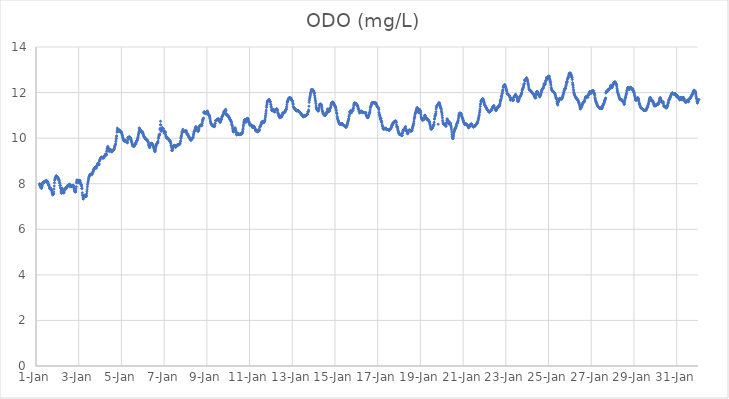
| Category | ODO (mg/L) |
|---|---|
| 44562.166666666664 | 7.94 |
| 44562.177083333336 | 8 |
| 44562.1875 | 7.98 |
| 44562.197916666664 | 7.94 |
| 44562.208333333336 | 7.88 |
| 44562.21875 | 7.84 |
| 44562.229166666664 | 7.82 |
| 44562.239583333336 | 7.82 |
| 44562.25 | 7.81 |
| 44562.260416666664 | 7.81 |
| 44562.270833333336 | 7.81 |
| 44562.28125 | 7.87 |
| 44562.291666666664 | 7.94 |
| 44562.302083333336 | 7.99 |
| 44562.3125 | 8.03 |
| 44562.322916666664 | 8.05 |
| 44562.333333333336 | 8.06 |
| 44562.34375 | 8.05 |
| 44562.354166666664 | 8.04 |
| 44562.364583333336 | 8.04 |
| 44562.375 | 8.06 |
| 44562.385416666664 | 8.09 |
| 44562.395833333336 | 8.1 |
| 44562.40625 | 8.1 |
| 44562.416666666664 | 8.11 |
| 44562.427083333336 | 8.11 |
| 44562.4375 | 8.11 |
| 44562.447916666664 | 8.11 |
| 44562.458333333336 | 8.11 |
| 44562.46875 | 8.12 |
| 44562.479166666664 | 8.12 |
| 44562.489583333336 | 8.12 |
| 44562.5 | 8.12 |
| 44562.510416666664 | 8.12 |
| 44562.520833333336 | 8.12 |
| 44562.53125 | 8.05 |
| 44562.541666666664 | 8.04 |
| 44562.552083333336 | 8.06 |
| 44562.5625 | 8.04 |
| 44562.572916666664 | 7.98 |
| 44562.583333333336 | 7.94 |
| 44562.59375 | 7.95 |
| 44562.604166666664 | 7.94 |
| 44562.614583333336 | 7.9 |
| 44562.625 | 7.86 |
| 44562.635416666664 | 7.81 |
| 44562.645833333336 | 7.81 |
| 44562.65625 | 7.77 |
| 44562.666666666664 | 7.79 |
| 44562.677083333336 | 7.8 |
| 44562.6875 | 7.8 |
| 44562.697916666664 | 7.79 |
| 44562.708333333336 | 7.75 |
| 44562.71875 | 7.71 |
| 44562.729166666664 | 7.72 |
| 44562.739583333336 | 7.69 |
| 44562.75 | 7.63 |
| 44562.760416666664 | 7.56 |
| 44562.770833333336 | 7.54 |
| 44562.78125 | 7.5 |
| 44562.791666666664 | 7.54 |
| 44562.802083333336 | 7.56 |
| 44562.8125 | 7.54 |
| 44562.822916666664 | 7.56 |
| 44562.833333333336 | 7.64 |
| 44562.84375 | 7.77 |
| 44562.854166666664 | 7.9 |
| 44562.864583333336 | 8.04 |
| 44562.875 | 8.15 |
| 44562.885416666664 | 8.19 |
| 44562.895833333336 | 8.22 |
| 44562.90625 | 8.26 |
| 44562.916666666664 | 8.28 |
| 44562.927083333336 | 8.3 |
| 44562.9375 | 8.33 |
| 44562.947916666664 | 8.35 |
| 44562.958333333336 | 8.34 |
| 44562.96875 | 8.31 |
| 44562.979166666664 | 8.31 |
| 44562.989583333336 | 8.29 |
| 44563.0 | 8.28 |
| 44563.010416666664 | 8.28 |
| 44563.020833333336 | 8.27 |
| 44563.03125 | 8.26 |
| 44563.041666666664 | 8.2 |
| 44563.052083333336 | 8.19 |
| 44563.0625 | 8.2 |
| 44563.072916666664 | 8.15 |
| 44563.083333333336 | 8.16 |
| 44563.09375 | 8.12 |
| 44563.104166666664 | 8.04 |
| 44563.114583333336 | 8.02 |
| 44563.125 | 7.92 |
| 44563.135416666664 | 7.93 |
| 44563.145833333336 | 7.82 |
| 44563.15625 | 7.79 |
| 44563.166666666664 | 7.68 |
| 44563.177083333336 | 7.63 |
| 44563.1875 | 7.58 |
| 44563.197916666664 | 7.76 |
| 44563.208333333336 | 7.8 |
| 44563.21875 | 7.81 |
| 44563.229166666664 | 7.78 |
| 44563.239583333336 | 7.73 |
| 44563.25 | 7.67 |
| 44563.260416666664 | 7.62 |
| 44563.270833333336 | 7.61 |
| 44563.28125 | 7.61 |
| 44563.291666666664 | 7.61 |
| 44563.302083333336 | 7.59 |
| 44563.3125 | 7.61 |
| 44563.322916666664 | 7.68 |
| 44563.333333333336 | 7.73 |
| 44563.34375 | 7.77 |
| 44563.354166666664 | 7.79 |
| 44563.364583333336 | 7.79 |
| 44563.375 | 7.8 |
| 44563.385416666664 | 7.78 |
| 44563.395833333336 | 7.77 |
| 44563.40625 | 7.78 |
| 44563.416666666664 | 7.8 |
| 44563.427083333336 | 7.83 |
| 44563.4375 | 7.86 |
| 44563.447916666664 | 7.89 |
| 44563.458333333336 | 7.89 |
| 44563.46875 | 7.9 |
| 44563.479166666664 | 7.9 |
| 44563.489583333336 | 7.92 |
| 44563.5 | 7.91 |
| 44563.510416666664 | 7.92 |
| 44563.520833333336 | 7.91 |
| 44563.53125 | 7.94 |
| 44563.541666666664 | 7.92 |
| 44563.552083333336 | 7.94 |
| 44563.5625 | 7.98 |
| 44563.572916666664 | 7.96 |
| 44563.583333333336 | 7.86 |
| 44563.59375 | 7.96 |
| 44563.604166666664 | 7.94 |
| 44563.614583333336 | 7.91 |
| 44563.625 | 7.88 |
| 44563.635416666664 | 7.88 |
| 44563.645833333336 | 7.87 |
| 44563.65625 | 7.88 |
| 44563.666666666664 | 7.89 |
| 44563.677083333336 | 7.89 |
| 44563.6875 | 7.89 |
| 44563.697916666664 | 7.92 |
| 44563.708333333336 | 7.89 |
| 44563.71875 | 7.92 |
| 44563.729166666664 | 7.91 |
| 44563.739583333336 | 7.93 |
| 44563.75 | 7.93 |
| 44563.760416666664 | 7.9 |
| 44563.770833333336 | 7.88 |
| 44563.78125 | 7.8 |
| 44563.791666666664 | 7.75 |
| 44563.802083333336 | 7.7 |
| 44563.8125 | 7.65 |
| 44563.822916666664 | 7.65 |
| 44563.833333333336 | 7.66 |
| 44563.84375 | 7.65 |
| 44563.854166666664 | 7.63 |
| 44563.864583333336 | 7.68 |
| 44563.875 | 7.77 |
| 44563.885416666664 | 7.87 |
| 44563.895833333336 | 8.04 |
| 44563.90625 | 8.11 |
| 44563.916666666664 | 8.16 |
| 44563.927083333336 | 8.16 |
| 44563.9375 | 8.12 |
| 44563.947916666664 | 8.06 |
| 44563.958333333336 | 8.04 |
| 44563.96875 | 8.04 |
| 44563.979166666664 | 8.06 |
| 44563.989583333336 | 8.08 |
| 44564.0 | 8.11 |
| 44564.010416666664 | 8.13 |
| 44564.020833333336 | 8.14 |
| 44564.03125 | 8.15 |
| 44564.041666666664 | 8.14 |
| 44564.052083333336 | 8.14 |
| 44564.0625 | 8.12 |
| 44564.072916666664 | 8.01 |
| 44564.083333333336 | 8.06 |
| 44564.09375 | 8.01 |
| 44564.104166666664 | 7.97 |
| 44564.114583333336 | 7.95 |
| 44564.125 | 7.94 |
| 44564.135416666664 | 7.89 |
| 44564.145833333336 | 7.78 |
| 44564.15625 | 7.8 |
| 44564.166666666664 | 7.6 |
| 44564.177083333336 | 7.5 |
| 44564.1875 | 7.48 |
| 44564.197916666664 | 7.41 |
| 44564.208333333336 | 7.33 |
| 44564.21875 | 7.34 |
| 44564.229166666664 | 7.41 |
| 44564.239583333336 | 7.48 |
| 44564.25 | 7.49 |
| 44564.260416666664 | 7.5 |
| 44564.270833333336 | 7.47 |
| 44564.28125 | 7.45 |
| 44564.291666666664 | 7.45 |
| 44564.302083333336 | 7.45 |
| 44564.3125 | 7.47 |
| 44564.322916666664 | 7.47 |
| 44564.333333333336 | 7.48 |
| 44564.34375 | 7.43 |
| 44564.354166666664 | 7.46 |
| 44564.364583333336 | 7.48 |
| 44564.375 | 7.57 |
| 44564.385416666664 | 7.66 |
| 44564.395833333336 | 7.75 |
| 44564.40625 | 7.86 |
| 44564.416666666664 | 7.96 |
| 44564.427083333336 | 8.03 |
| 44564.4375 | 8.08 |
| 44564.447916666664 | 8.13 |
| 44564.458333333336 | 8.2 |
| 44564.46875 | 8.25 |
| 44564.479166666664 | 8.29 |
| 44564.489583333336 | 8.33 |
| 44564.5 | 8.34 |
| 44564.510416666664 | 8.36 |
| 44564.520833333336 | 8.38 |
| 44564.53125 | 8.4 |
| 44564.541666666664 | 8.41 |
| 44564.552083333336 | 8.41 |
| 44564.5625 | 8.41 |
| 44564.572916666664 | 8.42 |
| 44564.583333333336 | 8.41 |
| 44564.59375 | 8.39 |
| 44564.604166666664 | 8.43 |
| 44564.614583333336 | 8.41 |
| 44564.625 | 8.42 |
| 44564.635416666664 | 8.44 |
| 44564.645833333336 | 8.48 |
| 44564.65625 | 8.5 |
| 44564.666666666664 | 8.52 |
| 44564.677083333336 | 8.53 |
| 44564.6875 | 8.58 |
| 44564.697916666664 | 8.62 |
| 44564.708333333336 | 8.62 |
| 44564.71875 | 8.67 |
| 44564.729166666664 | 8.66 |
| 44564.739583333336 | 8.69 |
| 44564.75 | 8.7 |
| 44564.760416666664 | 8.69 |
| 44564.770833333336 | 8.71 |
| 44564.78125 | 8.71 |
| 44564.791666666664 | 8.69 |
| 44564.802083333336 | 8.69 |
| 44564.8125 | 8.72 |
| 44564.822916666664 | 8.68 |
| 44564.833333333336 | 8.75 |
| 44564.84375 | 8.77 |
| 44564.854166666664 | 8.8 |
| 44564.864583333336 | 8.8 |
| 44564.875 | 8.85 |
| 44564.885416666664 | 8.88 |
| 44564.895833333336 | 8.9 |
| 44564.90625 | 8.89 |
| 44564.916666666664 | 8.88 |
| 44564.927083333336 | 8.87 |
| 44564.9375 | 8.84 |
| 44564.947916666664 | 8.83 |
| 44564.958333333336 | 8.87 |
| 44564.96875 | 8.99 |
| 44564.979166666664 | 9.02 |
| 44564.989583333336 | 9.04 |
| 44565.0 | 9.08 |
| 44565.010416666664 | 9.1 |
| 44565.020833333336 | 9.11 |
| 44565.03125 | 9.12 |
| 44565.041666666664 | 9.14 |
| 44565.052083333336 | 9.16 |
| 44565.0625 | 9.16 |
| 44565.072916666664 | 9.16 |
| 44565.083333333336 | 9.16 |
| 44565.09375 | 9.16 |
| 44565.104166666664 | 9.15 |
| 44565.114583333336 | 9.15 |
| 44565.125 | 9.12 |
| 44565.135416666664 | 9.13 |
| 44565.145833333336 | 9.13 |
| 44565.15625 | 9.14 |
| 44565.166666666664 | 9.16 |
| 44565.177083333336 | 9.14 |
| 44565.1875 | 9.16 |
| 44565.197916666664 | 9.22 |
| 44565.208333333336 | 9.21 |
| 44565.21875 | 9.23 |
| 44565.229166666664 | 9.23 |
| 44565.239583333336 | 9.26 |
| 44565.25 | 9.3 |
| 44565.260416666664 | 9.28 |
| 44565.270833333336 | 9.27 |
| 44565.28125 | 9.3 |
| 44565.291666666664 | 9.25 |
| 44565.302083333336 | 9.29 |
| 44565.3125 | 9.41 |
| 44565.322916666664 | 9.47 |
| 44565.333333333336 | 9.52 |
| 44565.34375 | 9.56 |
| 44565.354166666664 | 9.6 |
| 44565.364583333336 | 9.64 |
| 44565.375 | 9.6 |
| 44565.385416666664 | 9.56 |
| 44565.395833333336 | 9.53 |
| 44565.40625 | 9.51 |
| 44565.416666666664 | 9.5 |
| 44565.427083333336 | 9.46 |
| 44565.4375 | 9.41 |
| 44565.447916666664 | 9.44 |
| 44565.458333333336 | 9.46 |
| 44565.46875 | 9.49 |
| 44565.479166666664 | 9.5 |
| 44565.489583333336 | 9.49 |
| 44565.5 | 9.48 |
| 44565.510416666664 | 9.48 |
| 44565.520833333336 | 9.47 |
| 44565.53125 | 9.43 |
| 44565.541666666664 | 9.4 |
| 44565.552083333336 | 9.4 |
| 44565.5625 | 9.41 |
| 44565.572916666664 | 9.43 |
| 44565.583333333336 | 9.45 |
| 44565.59375 | 9.45 |
| 44565.604166666664 | 9.45 |
| 44565.614583333336 | 9.47 |
| 44565.625 | 9.48 |
| 44565.635416666664 | 9.5 |
| 44565.645833333336 | 9.5 |
| 44565.65625 | 9.52 |
| 44565.666666666664 | 9.55 |
| 44565.677083333336 | 9.6 |
| 44565.6875 | 9.64 |
| 44565.697916666664 | 9.67 |
| 44565.708333333336 | 9.7 |
| 44565.71875 | 9.73 |
| 44565.729166666664 | 9.75 |
| 44565.739583333336 | 9.85 |
| 44565.75 | 9.92 |
| 44565.760416666664 | 9.99 |
| 44565.770833333336 | 10.07 |
| 44565.78125 | 10.1 |
| 44565.791666666664 | 10.26 |
| 44565.802083333336 | 10.35 |
| 44565.8125 | 10.44 |
| 44565.822916666664 | 10.38 |
| 44565.833333333336 | 10.34 |
| 44565.84375 | 10.3 |
| 44565.854166666664 | 10.29 |
| 44565.864583333336 | 10.33 |
| 44565.875 | 10.34 |
| 44565.885416666664 | 10.35 |
| 44565.895833333336 | 10.36 |
| 44565.90625 | 10.36 |
| 44565.916666666664 | 10.32 |
| 44565.927083333336 | 10.3 |
| 44565.9375 | 10.28 |
| 44565.947916666664 | 10.27 |
| 44565.958333333336 | 10.29 |
| 44565.96875 | 10.31 |
| 44565.979166666664 | 10.3 |
| 44565.989583333336 | 10.27 |
| 44566.0 | 10.25 |
| 44566.010416666664 | 10.23 |
| 44566.020833333336 | 10.19 |
| 44566.03125 | 10.16 |
| 44566.041666666664 | 10.12 |
| 44566.052083333336 | 10.09 |
| 44566.0625 | 10.04 |
| 44566.072916666664 | 10 |
| 44566.083333333336 | 9.97 |
| 44566.09375 | 9.93 |
| 44566.104166666664 | 9.91 |
| 44566.114583333336 | 9.89 |
| 44566.125 | 9.88 |
| 44566.135416666664 | 9.87 |
| 44566.145833333336 | 9.86 |
| 44566.15625 | 9.87 |
| 44566.166666666664 | 9.91 |
| 44566.177083333336 | 9.92 |
| 44566.1875 | 9.87 |
| 44566.197916666664 | 9.86 |
| 44566.208333333336 | 9.84 |
| 44566.21875 | 9.87 |
| 44566.229166666664 | 9.85 |
| 44566.239583333336 | 9.86 |
| 44566.25 | 9.83 |
| 44566.260416666664 | 9.83 |
| 44566.270833333336 | 9.83 |
| 44566.28125 | 9.79 |
| 44566.291666666664 | 9.9 |
| 44566.302083333336 | 10.01 |
| 44566.3125 | 10.03 |
| 44566.322916666664 | 10.03 |
| 44566.333333333336 | 10.05 |
| 44566.34375 | 9.99 |
| 44566.354166666664 | 9.99 |
| 44566.364583333336 | 10.02 |
| 44566.375 | 10.05 |
| 44566.385416666664 | 10.06 |
| 44566.395833333336 | 10.02 |
| 44566.40625 | 10.01 |
| 44566.416666666664 | 10.01 |
| 44566.427083333336 | 10 |
| 44566.4375 | 9.99 |
| 44566.447916666664 | 9.95 |
| 44566.458333333336 | 9.9 |
| 44566.46875 | 9.87 |
| 44566.479166666664 | 9.84 |
| 44566.489583333336 | 9.81 |
| 44566.5 | 9.77 |
| 44566.510416666664 | 9.72 |
| 44566.520833333336 | 9.69 |
| 44566.53125 | 9.66 |
| 44566.541666666664 | 9.66 |
| 44566.552083333336 | 9.65 |
| 44566.5625 | 9.65 |
| 44566.572916666664 | 9.65 |
| 44566.583333333336 | 9.65 |
| 44566.59375 | 9.65 |
| 44566.604166666664 | 9.66 |
| 44566.614583333336 | 9.69 |
| 44566.625 | 9.71 |
| 44566.635416666664 | 9.73 |
| 44566.645833333336 | 9.75 |
| 44566.65625 | 9.77 |
| 44566.666666666664 | 9.77 |
| 44566.677083333336 | 9.74 |
| 44566.6875 | 9.8 |
| 44566.697916666664 | 9.85 |
| 44566.708333333336 | 9.87 |
| 44566.71875 | 9.89 |
| 44566.729166666664 | 9.9 |
| 44566.739583333336 | 9.91 |
| 44566.75 | 9.96 |
| 44566.760416666664 | 9.98 |
| 44566.770833333336 | 10.03 |
| 44566.78125 | 10.06 |
| 44566.791666666664 | 10.13 |
| 44566.802083333336 | 10.18 |
| 44566.8125 | 10.23 |
| 44566.822916666664 | 10.3 |
| 44566.833333333336 | 10.45 |
| 44566.84375 | 10.42 |
| 44566.854166666664 | 10.37 |
| 44566.864583333336 | 10.35 |
| 44566.875 | 10.37 |
| 44566.885416666664 | 10.35 |
| 44566.895833333336 | 10.36 |
| 44566.90625 | 10.32 |
| 44566.916666666664 | 10.33 |
| 44566.927083333336 | 10.34 |
| 44566.9375 | 10.28 |
| 44566.947916666664 | 10.26 |
| 44566.958333333336 | 10.23 |
| 44566.96875 | 10.24 |
| 44566.979166666664 | 10.26 |
| 44566.989583333336 | 10.27 |
| 44567.0 | 10.25 |
| 44567.010416666664 | 10.21 |
| 44567.020833333336 | 10.17 |
| 44567.03125 | 10.14 |
| 44567.041666666664 | 10.1 |
| 44567.052083333336 | 10.08 |
| 44567.0625 | 10.05 |
| 44567.072916666664 | 10.03 |
| 44567.083333333336 | 10.03 |
| 44567.09375 | 10.03 |
| 44567.104166666664 | 10.02 |
| 44567.114583333336 | 9.99 |
| 44567.125 | 9.98 |
| 44567.135416666664 | 9.96 |
| 44567.145833333336 | 9.95 |
| 44567.15625 | 9.95 |
| 44567.166666666664 | 9.94 |
| 44567.177083333336 | 9.93 |
| 44567.1875 | 9.93 |
| 44567.197916666664 | 9.93 |
| 44567.208333333336 | 9.89 |
| 44567.21875 | 9.89 |
| 44567.229166666664 | 9.87 |
| 44567.239583333336 | 9.87 |
| 44567.25 | 9.83 |
| 44567.260416666664 | 9.83 |
| 44567.270833333336 | 9.74 |
| 44567.28125 | 9.68 |
| 44567.291666666664 | 9.68 |
| 44567.302083333336 | 9.62 |
| 44567.3125 | 9.59 |
| 44567.322916666664 | 9.59 |
| 44567.333333333336 | 9.62 |
| 44567.34375 | 9.74 |
| 44567.354166666664 | 9.75 |
| 44567.364583333336 | 9.73 |
| 44567.375 | 9.74 |
| 44567.385416666664 | 9.75 |
| 44567.395833333336 | 9.76 |
| 44567.40625 | 9.71 |
| 44567.416666666664 | 9.78 |
| 44567.427083333336 | 9.77 |
| 44567.4375 | 9.75 |
| 44567.447916666664 | 9.73 |
| 44567.458333333336 | 9.71 |
| 44567.46875 | 9.71 |
| 44567.479166666664 | 9.7 |
| 44567.489583333336 | 9.67 |
| 44567.5 | 9.62 |
| 44567.510416666664 | 9.59 |
| 44567.520833333336 | 9.55 |
| 44567.53125 | 9.52 |
| 44567.541666666664 | 9.47 |
| 44567.552083333336 | 9.44 |
| 44567.5625 | 9.41 |
| 44567.572916666664 | 9.41 |
| 44567.583333333336 | 9.45 |
| 44567.59375 | 9.51 |
| 44567.604166666664 | 9.58 |
| 44567.614583333336 | 9.64 |
| 44567.625 | 9.67 |
| 44567.635416666664 | 9.71 |
| 44567.645833333336 | 9.72 |
| 44567.65625 | 9.76 |
| 44567.666666666664 | 9.78 |
| 44567.677083333336 | 9.77 |
| 44567.6875 | 9.82 |
| 44567.697916666664 | 9.83 |
| 44567.708333333336 | 9.79 |
| 44567.71875 | 9.87 |
| 44567.729166666664 | 9.98 |
| 44567.739583333336 | 10.02 |
| 44567.75 | 10.09 |
| 44567.760416666664 | 10.14 |
| 44567.770833333336 | 10.14 |
| 44567.78125 | 10.12 |
| 44567.791666666664 | 10.18 |
| 44567.802083333336 | 10.38 |
| 44567.8125 | 10.43 |
| 44567.822916666664 | 10.59 |
| 44567.833333333336 | 10.74 |
| 44567.84375 | 10.58 |
| 44567.854166666664 | 10.39 |
| 44567.864583333336 | 10.3 |
| 44567.875 | 10.33 |
| 44567.885416666664 | 10.35 |
| 44567.895833333336 | 10.45 |
| 44567.90625 | 10.43 |
| 44567.916666666664 | 10.46 |
| 44567.927083333336 | 10.44 |
| 44567.9375 | 10.42 |
| 44567.947916666664 | 10.41 |
| 44567.958333333336 | 10.41 |
| 44567.96875 | 10.34 |
| 44567.979166666664 | 10.33 |
| 44567.989583333336 | 10.28 |
| 44568.0 | 10.23 |
| 44568.010416666664 | 10.21 |
| 44568.020833333336 | 10.23 |
| 44568.03125 | 10.25 |
| 44568.041666666664 | 10.27 |
| 44568.052083333336 | 10.29 |
| 44568.0625 | 10.24 |
| 44568.072916666664 | 10.14 |
| 44568.083333333336 | 10.09 |
| 44568.09375 | 10.05 |
| 44568.104166666664 | 10.02 |
| 44568.114583333336 | 10.01 |
| 44568.125 | 10 |
| 44568.135416666664 | 10.01 |
| 44568.145833333336 | 10.02 |
| 44568.15625 | 10 |
| 44568.166666666664 | 10.01 |
| 44568.177083333336 | 9.99 |
| 44568.1875 | 9.98 |
| 44568.197916666664 | 9.96 |
| 44568.208333333336 | 9.95 |
| 44568.21875 | 9.93 |
| 44568.229166666664 | 9.93 |
| 44568.239583333336 | 9.9 |
| 44568.25 | 9.9 |
| 44568.260416666664 | 9.88 |
| 44568.270833333336 | 9.87 |
| 44568.28125 | 9.86 |
| 44568.291666666664 | 9.87 |
| 44568.302083333336 | 9.82 |
| 44568.3125 | 9.76 |
| 44568.322916666664 | 9.69 |
| 44568.333333333336 | 9.66 |
| 44568.34375 | 9.6 |
| 44568.354166666664 | 9.46 |
| 44568.364583333336 | 9.53 |
| 44568.375 | 9.45 |
| 44568.385416666664 | 9.46 |
| 44568.395833333336 | 9.5 |
| 44568.40625 | 9.56 |
| 44568.416666666664 | 9.58 |
| 44568.427083333336 | 9.6 |
| 44568.4375 | 9.65 |
| 44568.447916666664 | 9.67 |
| 44568.458333333336 | 9.68 |
| 44568.46875 | 9.68 |
| 44568.479166666664 | 9.67 |
| 44568.489583333336 | 9.67 |
| 44568.5 | 9.68 |
| 44568.510416666664 | 9.68 |
| 44568.520833333336 | 9.64 |
| 44568.53125 | 9.61 |
| 44568.541666666664 | 9.6 |
| 44568.552083333336 | 9.62 |
| 44568.5625 | 9.63 |
| 44568.572916666664 | 9.64 |
| 44568.583333333336 | 9.66 |
| 44568.59375 | 9.66 |
| 44568.604166666664 | 9.68 |
| 44568.614583333336 | 9.7 |
| 44568.625 | 9.71 |
| 44568.635416666664 | 9.71 |
| 44568.645833333336 | 9.72 |
| 44568.65625 | 9.71 |
| 44568.666666666664 | 9.7 |
| 44568.677083333336 | 9.7 |
| 44568.6875 | 9.72 |
| 44568.697916666664 | 9.71 |
| 44568.708333333336 | 9.72 |
| 44568.71875 | 9.73 |
| 44568.729166666664 | 9.75 |
| 44568.739583333336 | 9.74 |
| 44568.75 | 9.78 |
| 44568.760416666664 | 9.85 |
| 44568.770833333336 | 9.87 |
| 44568.78125 | 9.98 |
| 44568.791666666664 | 10.02 |
| 44568.802083333336 | 10.07 |
| 44568.8125 | 10.11 |
| 44568.822916666664 | 10.18 |
| 44568.833333333336 | 10.29 |
| 44568.84375 | 10.26 |
| 44568.854166666664 | 10.27 |
| 44568.864583333336 | 10.3 |
| 44568.875 | 10.39 |
| 44568.885416666664 | 10.3 |
| 44568.895833333336 | 10.29 |
| 44568.90625 | 10.29 |
| 44568.916666666664 | 10.28 |
| 44568.927083333336 | 10.28 |
| 44568.9375 | 10.31 |
| 44568.947916666664 | 10.3 |
| 44568.958333333336 | 10.3 |
| 44568.96875 | 10.31 |
| 44568.979166666664 | 10.3 |
| 44568.989583333336 | 10.31 |
| 44569.0 | 10.31 |
| 44569.010416666664 | 10.3 |
| 44569.020833333336 | 10.31 |
| 44569.03125 | 10.32 |
| 44569.041666666664 | 10.31 |
| 44569.052083333336 | 10.24 |
| 44569.0625 | 10.21 |
| 44569.072916666664 | 10.17 |
| 44569.083333333336 | 10.18 |
| 44569.09375 | 10.18 |
| 44569.104166666664 | 10.19 |
| 44569.114583333336 | 10.17 |
| 44569.125 | 10.12 |
| 44569.135416666664 | 10.09 |
| 44569.145833333336 | 10.07 |
| 44569.15625 | 10.06 |
| 44569.166666666664 | 10.06 |
| 44569.177083333336 | 10.03 |
| 44569.1875 | 10 |
| 44569.197916666664 | 9.98 |
| 44569.208333333336 | 9.97 |
| 44569.21875 | 9.96 |
| 44569.229166666664 | 9.94 |
| 44569.239583333336 | 9.94 |
| 44569.25 | 9.92 |
| 44569.260416666664 | 9.9 |
| 44569.270833333336 | 9.93 |
| 44569.28125 | 9.96 |
| 44569.291666666664 | 9.96 |
| 44569.302083333336 | 9.97 |
| 44569.3125 | 9.98 |
| 44569.322916666664 | 9.99 |
| 44569.333333333336 | 9.99 |
| 44569.34375 | 10.02 |
| 44569.354166666664 | 10.03 |
| 44569.364583333336 | 10.09 |
| 44569.375 | 10.15 |
| 44569.385416666664 | 10.2 |
| 44569.395833333336 | 10.26 |
| 44569.40625 | 10.29 |
| 44569.416666666664 | 10.3 |
| 44569.427083333336 | 10.31 |
| 44569.4375 | 10.35 |
| 44569.447916666664 | 10.39 |
| 44569.458333333336 | 10.42 |
| 44569.46875 | 10.47 |
| 44569.479166666664 | 10.5 |
| 44569.489583333336 | 10.48 |
| 44569.5 | 10.49 |
| 44569.510416666664 | 10.48 |
| 44569.520833333336 | 10.43 |
| 44569.53125 | 10.41 |
| 44569.541666666664 | 10.38 |
| 44569.552083333336 | 10.35 |
| 44569.5625 | 10.33 |
| 44569.572916666664 | 10.32 |
| 44569.583333333336 | 10.3 |
| 44569.59375 | 10.3 |
| 44569.604166666664 | 10.33 |
| 44569.614583333336 | 10.35 |
| 44569.625 | 10.39 |
| 44569.635416666664 | 10.44 |
| 44569.645833333336 | 10.49 |
| 44569.65625 | 10.52 |
| 44569.666666666664 | 10.55 |
| 44569.677083333336 | 10.56 |
| 44569.6875 | 10.56 |
| 44569.697916666664 | 10.58 |
| 44569.708333333336 | 10.56 |
| 44569.71875 | 10.56 |
| 44569.729166666664 | 10.57 |
| 44569.739583333336 | 10.56 |
| 44569.75 | 10.55 |
| 44569.760416666664 | 10.56 |
| 44569.770833333336 | 10.56 |
| 44569.78125 | 10.64 |
| 44569.791666666664 | 10.71 |
| 44569.802083333336 | 10.8 |
| 44569.8125 | 10.78 |
| 44569.822916666664 | 10.83 |
| 44569.833333333336 | 10.86 |
| 44569.84375 | 10.88 |
| 44569.854166666664 | 11.11 |
| 44569.864583333336 | 11.14 |
| 44569.875 | 11.15 |
| 44569.885416666664 | 11.16 |
| 44569.895833333336 | 11.13 |
| 44569.90625 | 11.11 |
| 44569.916666666664 | 11.09 |
| 44569.927083333336 | 11.08 |
| 44569.9375 | 11.08 |
| 44569.947916666664 | 11.08 |
| 44569.958333333336 | 11.09 |
| 44569.96875 | 11.11 |
| 44569.979166666664 | 11.12 |
| 44569.989583333336 | 11.14 |
| 44570.0 | 11.16 |
| 44570.010416666664 | 11.18 |
| 44570.020833333336 | 11.18 |
| 44570.03125 | 11.18 |
| 44570.041666666664 | 11.12 |
| 44570.052083333336 | 11.1 |
| 44570.0625 | 11.09 |
| 44570.072916666664 | 11.04 |
| 44570.083333333336 | 11.01 |
| 44570.09375 | 11 |
| 44570.104166666664 | 11.02 |
| 44570.114583333336 | 11 |
| 44570.125 | 10.96 |
| 44570.135416666664 | 10.9 |
| 44570.145833333336 | 10.86 |
| 44570.15625 | 10.8 |
| 44570.166666666664 | 10.74 |
| 44570.177083333336 | 10.7 |
| 44570.1875 | 10.66 |
| 44570.197916666664 | 10.65 |
| 44570.208333333336 | 10.63 |
| 44570.21875 | 10.6 |
| 44570.229166666664 | 10.59 |
| 44570.239583333336 | 10.58 |
| 44570.25 | 10.57 |
| 44570.260416666664 | 10.56 |
| 44570.270833333336 | 10.54 |
| 44570.28125 | 10.55 |
| 44570.291666666664 | 10.55 |
| 44570.302083333336 | 10.54 |
| 44570.3125 | 10.52 |
| 44570.322916666664 | 10.53 |
| 44570.333333333336 | 10.51 |
| 44570.34375 | 10.52 |
| 44570.354166666664 | 10.5 |
| 44570.364583333336 | 10.53 |
| 44570.375 | 10.57 |
| 44570.385416666664 | 10.65 |
| 44570.395833333336 | 10.65 |
| 44570.40625 | 10.77 |
| 44570.416666666664 | 10.77 |
| 44570.427083333336 | 10.78 |
| 44570.4375 | 10.78 |
| 44570.447916666664 | 10.79 |
| 44570.458333333336 | 10.79 |
| 44570.46875 | 10.8 |
| 44570.479166666664 | 10.82 |
| 44570.489583333336 | 10.83 |
| 44570.5 | 10.81 |
| 44570.510416666664 | 10.81 |
| 44570.520833333336 | 10.8 |
| 44570.53125 | 10.85 |
| 44570.541666666664 | 10.85 |
| 44570.552083333336 | 10.8 |
| 44570.5625 | 10.82 |
| 44570.572916666664 | 10.78 |
| 44570.583333333336 | 10.77 |
| 44570.59375 | 10.77 |
| 44570.604166666664 | 10.73 |
| 44570.614583333336 | 10.71 |
| 44570.625 | 10.69 |
| 44570.635416666664 | 10.72 |
| 44570.645833333336 | 10.74 |
| 44570.65625 | 10.77 |
| 44570.666666666664 | 10.81 |
| 44570.677083333336 | 10.83 |
| 44570.6875 | 10.86 |
| 44570.697916666664 | 10.89 |
| 44570.708333333336 | 10.94 |
| 44570.71875 | 10.94 |
| 44570.729166666664 | 10.97 |
| 44570.739583333336 | 10.99 |
| 44570.75 | 11.01 |
| 44570.760416666664 | 11.04 |
| 44570.770833333336 | 11.05 |
| 44570.78125 | 11.07 |
| 44570.791666666664 | 11.14 |
| 44570.802083333336 | 11.16 |
| 44570.8125 | 11.12 |
| 44570.822916666664 | 11.16 |
| 44570.833333333336 | 11.15 |
| 44570.84375 | 11.19 |
| 44570.854166666664 | 11.22 |
| 44570.864583333336 | 11.25 |
| 44570.875 | 11.21 |
| 44570.885416666664 | 11.26 |
| 44570.895833333336 | 11.21 |
| 44570.90625 | 11.08 |
| 44570.916666666664 | 11.03 |
| 44570.927083333336 | 11.02 |
| 44570.9375 | 11.01 |
| 44570.947916666664 | 11.02 |
| 44570.958333333336 | 11.02 |
| 44570.96875 | 11.01 |
| 44570.979166666664 | 10.99 |
| 44570.989583333336 | 10.98 |
| 44571.0 | 10.97 |
| 44571.010416666664 | 10.95 |
| 44571.020833333336 | 10.94 |
| 44571.03125 | 10.92 |
| 44571.041666666664 | 10.89 |
| 44571.052083333336 | 10.89 |
| 44571.0625 | 10.9 |
| 44571.072916666664 | 10.84 |
| 44571.083333333336 | 10.81 |
| 44571.09375 | 10.8 |
| 44571.104166666664 | 10.79 |
| 44571.114583333336 | 10.8 |
| 44571.125 | 10.77 |
| 44571.135416666664 | 10.73 |
| 44571.145833333336 | 10.71 |
| 44571.15625 | 10.68 |
| 44571.166666666664 | 10.6 |
| 44571.177083333336 | 10.58 |
| 44571.1875 | 10.56 |
| 44571.197916666664 | 10.5 |
| 44571.208333333336 | 10.43 |
| 44571.21875 | 10.36 |
| 44571.229166666664 | 10.31 |
| 44571.239583333336 | 10.28 |
| 44571.25 | 10.28 |
| 44571.260416666664 | 10.29 |
| 44571.270833333336 | 10.31 |
| 44571.28125 | 10.36 |
| 44571.291666666664 | 10.39 |
| 44571.302083333336 | 10.38 |
| 44571.3125 | 10.4 |
| 44571.322916666664 | 10.46 |
| 44571.333333333336 | 10.41 |
| 44571.34375 | 10.38 |
| 44571.354166666664 | 10.35 |
| 44571.364583333336 | 10.31 |
| 44571.375 | 10.27 |
| 44571.385416666664 | 10.18 |
| 44571.395833333336 | 10.15 |
| 44571.40625 | 10.14 |
| 44571.416666666664 | 10.18 |
| 44571.427083333336 | 10.19 |
| 44571.4375 | 10.2 |
| 44571.447916666664 | 10.2 |
| 44571.458333333336 | 10.2 |
| 44571.46875 | 10.21 |
| 44571.479166666664 | 10.19 |
| 44571.489583333336 | 10.17 |
| 44571.5 | 10.17 |
| 44571.510416666664 | 10.16 |
| 44571.520833333336 | 10.16 |
| 44571.53125 | 10.16 |
| 44571.541666666664 | 10.17 |
| 44571.552083333336 | 10.17 |
| 44571.5625 | 10.19 |
| 44571.572916666664 | 10.17 |
| 44571.583333333336 | 10.17 |
| 44571.59375 | 10.17 |
| 44571.604166666664 | 10.19 |
| 44571.614583333336 | 10.19 |
| 44571.625 | 10.18 |
| 44571.635416666664 | 10.2 |
| 44571.645833333336 | 10.23 |
| 44571.65625 | 10.22 |
| 44571.666666666664 | 10.25 |
| 44571.677083333336 | 10.31 |
| 44571.6875 | 10.38 |
| 44571.697916666664 | 10.44 |
| 44571.708333333336 | 10.53 |
| 44571.71875 | 10.59 |
| 44571.729166666664 | 10.67 |
| 44571.739583333336 | 10.72 |
| 44571.75 | 10.76 |
| 44571.760416666664 | 10.8 |
| 44571.770833333336 | 10.81 |
| 44571.78125 | 10.81 |
| 44571.791666666664 | 10.8 |
| 44571.802083333336 | 10.79 |
| 44571.8125 | 10.77 |
| 44571.822916666664 | 10.72 |
| 44571.833333333336 | 10.69 |
| 44571.84375 | 10.73 |
| 44571.854166666664 | 10.81 |
| 44571.864583333336 | 10.82 |
| 44571.875 | 10.83 |
| 44571.885416666664 | 10.85 |
| 44571.895833333336 | 10.87 |
| 44571.90625 | 10.85 |
| 44571.916666666664 | 10.86 |
| 44571.927083333336 | 10.85 |
| 44571.9375 | 10.81 |
| 44571.947916666664 | 10.78 |
| 44571.958333333336 | 10.73 |
| 44571.96875 | 10.73 |
| 44571.979166666664 | 10.69 |
| 44571.989583333336 | 10.65 |
| 44572.0 | 10.65 |
| 44572.010416666664 | 10.59 |
| 44572.020833333336 | 10.57 |
| 44572.03125 | 10.57 |
| 44572.041666666664 | 10.57 |
| 44572.052083333336 | 10.58 |
| 44572.0625 | 10.58 |
| 44572.072916666664 | 10.57 |
| 44572.083333333336 | 10.56 |
| 44572.09375 | 10.56 |
| 44572.104166666664 | 10.55 |
| 44572.114583333336 | 10.51 |
| 44572.125 | 10.5 |
| 44572.135416666664 | 10.47 |
| 44572.145833333336 | 10.47 |
| 44572.15625 | 10.46 |
| 44572.166666666664 | 10.48 |
| 44572.177083333336 | 10.51 |
| 44572.1875 | 10.53 |
| 44572.197916666664 | 10.52 |
| 44572.208333333336 | 10.5 |
| 44572.21875 | 10.49 |
| 44572.229166666664 | 10.48 |
| 44572.239583333336 | 10.45 |
| 44572.25 | 10.43 |
| 44572.260416666664 | 10.41 |
| 44572.270833333336 | 10.39 |
| 44572.28125 | 10.35 |
| 44572.291666666664 | 10.33 |
| 44572.302083333336 | 10.31 |
| 44572.3125 | 10.31 |
| 44572.322916666664 | 10.32 |
| 44572.333333333336 | 10.32 |
| 44572.34375 | 10.33 |
| 44572.354166666664 | 10.32 |
| 44572.364583333336 | 10.3 |
| 44572.375 | 10.28 |
| 44572.385416666664 | 10.28 |
| 44572.395833333336 | 10.32 |
| 44572.40625 | 10.31 |
| 44572.416666666664 | 10.31 |
| 44572.427083333336 | 10.3 |
| 44572.4375 | 10.39 |
| 44572.447916666664 | 10.37 |
| 44572.458333333336 | 10.35 |
| 44572.46875 | 10.37 |
| 44572.479166666664 | 10.48 |
| 44572.489583333336 | 10.51 |
| 44572.5 | 10.51 |
| 44572.510416666664 | 10.52 |
| 44572.520833333336 | 10.56 |
| 44572.53125 | 10.59 |
| 44572.541666666664 | 10.62 |
| 44572.552083333336 | 10.66 |
| 44572.5625 | 10.69 |
| 44572.572916666664 | 10.7 |
| 44572.583333333336 | 10.71 |
| 44572.59375 | 10.73 |
| 44572.604166666664 | 10.7 |
| 44572.614583333336 | 10.66 |
| 44572.625 | 10.68 |
| 44572.635416666664 | 10.73 |
| 44572.645833333336 | 10.71 |
| 44572.65625 | 10.71 |
| 44572.666666666664 | 10.7 |
| 44572.677083333336 | 10.68 |
| 44572.6875 | 10.73 |
| 44572.697916666664 | 10.74 |
| 44572.708333333336 | 10.77 |
| 44572.71875 | 10.79 |
| 44572.729166666664 | 10.84 |
| 44572.739583333336 | 10.92 |
| 44572.75 | 10.99 |
| 44572.760416666664 | 11.07 |
| 44572.770833333336 | 11.15 |
| 44572.78125 | 11.23 |
| 44572.791666666664 | 11.35 |
| 44572.802083333336 | 11.42 |
| 44572.8125 | 11.49 |
| 44572.822916666664 | 11.54 |
| 44572.833333333336 | 11.58 |
| 44572.84375 | 11.62 |
| 44572.854166666664 | 11.64 |
| 44572.864583333336 | 11.66 |
| 44572.875 | 11.68 |
| 44572.885416666664 | 11.67 |
| 44572.895833333336 | 11.66 |
| 44572.90625 | 11.68 |
| 44572.916666666664 | 11.69 |
| 44572.927083333336 | 11.67 |
| 44572.9375 | 11.67 |
| 44572.947916666664 | 11.62 |
| 44572.958333333336 | 11.6 |
| 44572.96875 | 11.61 |
| 44572.979166666664 | 11.6 |
| 44572.989583333336 | 11.49 |
| 44573.0 | 11.47 |
| 44573.010416666664 | 11.39 |
| 44573.020833333336 | 11.35 |
| 44573.03125 | 11.27 |
| 44573.041666666664 | 11.21 |
| 44573.052083333336 | 11.2 |
| 44573.0625 | 11.2 |
| 44573.072916666664 | 11.22 |
| 44573.083333333336 | 11.24 |
| 44573.09375 | 11.25 |
| 44573.104166666664 | 11.25 |
| 44573.114583333336 | 11.25 |
| 44573.125 | 11.26 |
| 44573.135416666664 | 11.24 |
| 44573.145833333336 | 11.17 |
| 44573.15625 | 11.18 |
| 44573.166666666664 | 11.16 |
| 44573.177083333336 | 11.16 |
| 44573.1875 | 11.15 |
| 44573.197916666664 | 11.19 |
| 44573.208333333336 | 11.23 |
| 44573.21875 | 11.24 |
| 44573.229166666664 | 11.24 |
| 44573.239583333336 | 11.26 |
| 44573.25 | 11.27 |
| 44573.260416666664 | 11.28 |
| 44573.270833333336 | 11.29 |
| 44573.28125 | 11.28 |
| 44573.291666666664 | 11.26 |
| 44573.302083333336 | 11.24 |
| 44573.3125 | 11.21 |
| 44573.322916666664 | 11.13 |
| 44573.333333333336 | 11.09 |
| 44573.34375 | 11.07 |
| 44573.354166666664 | 11.04 |
| 44573.364583333336 | 11.01 |
| 44573.375 | 10.98 |
| 44573.385416666664 | 10.95 |
| 44573.395833333336 | 10.94 |
| 44573.40625 | 10.92 |
| 44573.416666666664 | 10.89 |
| 44573.427083333336 | 10.9 |
| 44573.4375 | 10.91 |
| 44573.447916666664 | 10.93 |
| 44573.458333333336 | 10.96 |
| 44573.46875 | 10.99 |
| 44573.479166666664 | 10.94 |
| 44573.489583333336 | 10.93 |
| 44573.5 | 10.94 |
| 44573.510416666664 | 10.94 |
| 44573.520833333336 | 10.98 |
| 44573.53125 | 11 |
| 44573.541666666664 | 11.05 |
| 44573.552083333336 | 11.1 |
| 44573.5625 | 11.11 |
| 44573.572916666664 | 11.1 |
| 44573.583333333336 | 11.1 |
| 44573.59375 | 11.1 |
| 44573.604166666664 | 11.11 |
| 44573.614583333336 | 11.11 |
| 44573.625 | 11.12 |
| 44573.635416666664 | 11.13 |
| 44573.645833333336 | 11.16 |
| 44573.65625 | 11.15 |
| 44573.666666666664 | 11.15 |
| 44573.677083333336 | 11.21 |
| 44573.6875 | 11.22 |
| 44573.697916666664 | 11.25 |
| 44573.708333333336 | 11.25 |
| 44573.71875 | 11.27 |
| 44573.729166666664 | 11.32 |
| 44573.739583333336 | 11.39 |
| 44573.75 | 11.48 |
| 44573.760416666664 | 11.59 |
| 44573.770833333336 | 11.57 |
| 44573.78125 | 11.6 |
| 44573.791666666664 | 11.65 |
| 44573.802083333336 | 11.67 |
| 44573.8125 | 11.7 |
| 44573.822916666664 | 11.72 |
| 44573.833333333336 | 11.74 |
| 44573.84375 | 11.76 |
| 44573.854166666664 | 11.76 |
| 44573.864583333336 | 11.77 |
| 44573.875 | 11.77 |
| 44573.885416666664 | 11.77 |
| 44573.895833333336 | 11.76 |
| 44573.90625 | 11.76 |
| 44573.916666666664 | 11.75 |
| 44573.927083333336 | 11.73 |
| 44573.9375 | 11.76 |
| 44573.947916666664 | 11.75 |
| 44573.958333333336 | 11.7 |
| 44573.96875 | 11.66 |
| 44573.979166666664 | 11.65 |
| 44573.989583333336 | 11.65 |
| 44574.0 | 11.64 |
| 44574.010416666664 | 11.64 |
| 44574.020833333336 | 11.59 |
| 44574.03125 | 11.53 |
| 44574.041666666664 | 11.48 |
| 44574.052083333336 | 11.39 |
| 44574.0625 | 11.36 |
| 44574.072916666664 | 11.35 |
| 44574.083333333336 | 11.33 |
| 44574.09375 | 11.31 |
| 44574.104166666664 | 11.3 |
| 44574.114583333336 | 11.29 |
| 44574.125 | 11.28 |
| 44574.135416666664 | 11.25 |
| 44574.145833333336 | 11.25 |
| 44574.15625 | 11.25 |
| 44574.166666666664 | 11.25 |
| 44574.177083333336 | 11.24 |
| 44574.1875 | 11.22 |
| 44574.197916666664 | 11.19 |
| 44574.208333333336 | 11.21 |
| 44574.21875 | 11.2 |
| 44574.229166666664 | 11.2 |
| 44574.239583333336 | 11.21 |
| 44574.25 | 11.21 |
| 44574.260416666664 | 11.2 |
| 44574.270833333336 | 11.2 |
| 44574.28125 | 11.21 |
| 44574.291666666664 | 11.2 |
| 44574.302083333336 | 11.18 |
| 44574.3125 | 11.17 |
| 44574.322916666664 | 11.17 |
| 44574.333333333336 | 11.16 |
| 44574.34375 | 11.15 |
| 44574.354166666664 | 11.13 |
| 44574.364583333336 | 11.12 |
| 44574.375 | 11.11 |
| 44574.385416666664 | 11.1 |
| 44574.395833333336 | 11.08 |
| 44574.40625 | 11.07 |
| 44574.416666666664 | 11.06 |
| 44574.427083333336 | 11.05 |
| 44574.4375 | 11.04 |
| 44574.447916666664 | 11.01 |
| 44574.458333333336 | 11.01 |
| 44574.46875 | 11 |
| 44574.479166666664 | 10.98 |
| 44574.489583333336 | 10.97 |
| 44574.5 | 10.95 |
| 44574.510416666664 | 10.95 |
| 44574.520833333336 | 10.95 |
| 44574.53125 | 10.93 |
| 44574.541666666664 | 10.95 |
| 44574.552083333336 | 10.99 |
| 44574.5625 | 10.98 |
| 44574.572916666664 | 10.98 |
| 44574.583333333336 | 11 |
| 44574.59375 | 10.99 |
| 44574.604166666664 | 10.98 |
| 44574.614583333336 | 10.97 |
| 44574.625 | 10.98 |
| 44574.635416666664 | 10.98 |
| 44574.645833333336 | 11 |
| 44574.65625 | 11 |
| 44574.666666666664 | 11.02 |
| 44574.677083333336 | 11.03 |
| 44574.6875 | 11.02 |
| 44574.697916666664 | 11.03 |
| 44574.708333333336 | 11.05 |
| 44574.71875 | 11.08 |
| 44574.729166666664 | 11.15 |
| 44574.739583333336 | 11.15 |
| 44574.75 | 11.17 |
| 44574.760416666664 | 11.17 |
| 44574.770833333336 | 11.24 |
| 44574.78125 | 11.4 |
| 44574.791666666664 | 11.57 |
| 44574.802083333336 | 11.66 |
| 44574.8125 | 11.72 |
| 44574.822916666664 | 11.79 |
| 44574.833333333336 | 11.83 |
| 44574.84375 | 11.88 |
| 44574.854166666664 | 11.94 |
| 44574.864583333336 | 12 |
| 44574.875 | 12.03 |
| 44574.885416666664 | 12.11 |
| 44574.895833333336 | 12.13 |
| 44574.90625 | 12.13 |
| 44574.916666666664 | 12.13 |
| 44574.927083333336 | 12.13 |
| 44574.9375 | 12.13 |
| 44574.947916666664 | 12.13 |
| 44574.958333333336 | 12.12 |
| 44574.96875 | 12.08 |
| 44574.979166666664 | 12.09 |
| 44574.989583333336 | 12.07 |
| 44575.0 | 12.05 |
| 44575.010416666664 | 12.03 |
| 44575.020833333336 | 11.99 |
| 44575.03125 | 11.95 |
| 44575.041666666664 | 11.97 |
| 44575.052083333336 | 11.86 |
| 44575.0625 | 11.78 |
| 44575.072916666664 | 11.72 |
| 44575.083333333336 | 11.65 |
| 44575.09375 | 11.59 |
| 44575.104166666664 | 11.51 |
| 44575.114583333336 | 11.41 |
| 44575.125 | 11.35 |
| 44575.135416666664 | 11.3 |
| 44575.145833333336 | 11.28 |
| 44575.15625 | 11.26 |
| 44575.166666666664 | 11.24 |
| 44575.177083333336 | 11.23 |
| 44575.1875 | 11.22 |
| 44575.197916666664 | 11.21 |
| 44575.208333333336 | 11.19 |
| 44575.21875 | 11.19 |
| 44575.229166666664 | 11.21 |
| 44575.239583333336 | 11.23 |
| 44575.25 | 11.29 |
| 44575.260416666664 | 11.34 |
| 44575.270833333336 | 11.43 |
| 44575.28125 | 11.48 |
| 44575.291666666664 | 11.49 |
| 44575.302083333336 | 11.48 |
| 44575.3125 | 11.49 |
| 44575.322916666664 | 11.49 |
| 44575.333333333336 | 11.49 |
| 44575.34375 | 11.49 |
| 44575.354166666664 | 11.48 |
| 44575.364583333336 | 11.45 |
| 44575.375 | 11.4 |
| 44575.385416666664 | 11.34 |
| 44575.395833333336 | 11.27 |
| 44575.40625 | 11.21 |
| 44575.416666666664 | 11.18 |
| 44575.427083333336 | 11.15 |
| 44575.4375 | 11.11 |
| 44575.447916666664 | 11.08 |
| 44575.458333333336 | 11.06 |
| 44575.46875 | 11.04 |
| 44575.479166666664 | 11.03 |
| 44575.489583333336 | 11.02 |
| 44575.5 | 11.06 |
| 44575.510416666664 | 10.99 |
| 44575.520833333336 | 10.99 |
| 44575.53125 | 11 |
| 44575.541666666664 | 11.02 |
| 44575.552083333336 | 11.03 |
| 44575.5625 | 11.02 |
| 44575.572916666664 | 11.05 |
| 44575.583333333336 | 11.05 |
| 44575.59375 | 11.07 |
| 44575.604166666664 | 11.1 |
| 44575.614583333336 | 11.11 |
| 44575.625 | 11.16 |
| 44575.635416666664 | 11.16 |
| 44575.645833333336 | 11.27 |
| 44575.65625 | 11.19 |
| 44575.666666666664 | 11.26 |
| 44575.677083333336 | 11.28 |
| 44575.6875 | 11.22 |
| 44575.697916666664 | 11.16 |
| 44575.708333333336 | 11.16 |
| 44575.71875 | 11.16 |
| 44575.729166666664 | 11.18 |
| 44575.739583333336 | 11.2 |
| 44575.75 | 11.21 |
| 44575.760416666664 | 11.29 |
| 44575.770833333336 | 11.32 |
| 44575.78125 | 11.32 |
| 44575.791666666664 | 11.33 |
| 44575.802083333336 | 11.36 |
| 44575.8125 | 11.44 |
| 44575.822916666664 | 11.46 |
| 44575.833333333336 | 11.5 |
| 44575.84375 | 11.55 |
| 44575.854166666664 | 11.56 |
| 44575.864583333336 | 11.56 |
| 44575.875 | 11.57 |
| 44575.885416666664 | 11.57 |
| 44575.895833333336 | 11.58 |
| 44575.90625 | 11.58 |
| 44575.916666666664 | 11.57 |
| 44575.927083333336 | 11.56 |
| 44575.9375 | 11.53 |
| 44575.947916666664 | 11.51 |
| 44575.958333333336 | 11.49 |
| 44575.96875 | 11.46 |
| 44575.979166666664 | 11.44 |
| 44575.989583333336 | 11.41 |
| 44576.0 | 11.43 |
| 44576.010416666664 | 11.39 |
| 44576.020833333336 | 11.36 |
| 44576.03125 | 11.33 |
| 44576.041666666664 | 11.29 |
| 44576.052083333336 | 11.23 |
| 44576.0625 | 11.21 |
| 44576.072916666664 | 11.12 |
| 44576.083333333336 | 11.1 |
| 44576.09375 | 11.07 |
| 44576.104166666664 | 10.96 |
| 44576.114583333336 | 10.89 |
| 44576.125 | 10.85 |
| 44576.135416666664 | 10.82 |
| 44576.145833333336 | 10.76 |
| 44576.15625 | 10.75 |
| 44576.166666666664 | 10.75 |
| 44576.177083333336 | 10.69 |
| 44576.1875 | 10.67 |
| 44576.197916666664 | 10.66 |
| 44576.208333333336 | 10.64 |
| 44576.21875 | 10.63 |
| 44576.229166666664 | 10.62 |
| 44576.239583333336 | 10.62 |
| 44576.25 | 10.6 |
| 44576.260416666664 | 10.61 |
| 44576.270833333336 | 10.6 |
| 44576.28125 | 10.6 |
| 44576.291666666664 | 10.63 |
| 44576.302083333336 | 10.65 |
| 44576.3125 | 10.6 |
| 44576.322916666664 | 10.61 |
| 44576.333333333336 | 10.63 |
| 44576.34375 | 10.63 |
| 44576.354166666664 | 10.61 |
| 44576.364583333336 | 10.59 |
| 44576.375 | 10.59 |
| 44576.385416666664 | 10.58 |
| 44576.395833333336 | 10.57 |
| 44576.40625 | 10.56 |
| 44576.416666666664 | 10.56 |
| 44576.427083333336 | 10.56 |
| 44576.4375 | 10.55 |
| 44576.447916666664 | 10.54 |
| 44576.458333333336 | 10.53 |
| 44576.46875 | 10.52 |
| 44576.479166666664 | 10.51 |
| 44576.489583333336 | 10.5 |
| 44576.5 | 10.49 |
| 44576.510416666664 | 10.48 |
| 44576.520833333336 | 10.48 |
| 44576.53125 | 10.49 |
| 44576.541666666664 | 10.51 |
| 44576.552083333336 | 10.56 |
| 44576.5625 | 10.57 |
| 44576.572916666664 | 10.59 |
| 44576.583333333336 | 10.63 |
| 44576.59375 | 10.67 |
| 44576.604166666664 | 10.71 |
| 44576.614583333336 | 10.74 |
| 44576.625 | 10.78 |
| 44576.635416666664 | 10.82 |
| 44576.645833333336 | 10.85 |
| 44576.65625 | 10.95 |
| 44576.666666666664 | 10.98 |
| 44576.677083333336 | 11.04 |
| 44576.6875 | 11.15 |
| 44576.697916666664 | 11.15 |
| 44576.708333333336 | 11.16 |
| 44576.71875 | 11.2 |
| 44576.729166666664 | 11.18 |
| 44576.739583333336 | 11.14 |
| 44576.75 | 11.12 |
| 44576.760416666664 | 11.11 |
| 44576.770833333336 | 11.12 |
| 44576.78125 | 11.15 |
| 44576.791666666664 | 11.18 |
| 44576.802083333336 | 11.21 |
| 44576.8125 | 11.22 |
| 44576.822916666664 | 11.22 |
| 44576.833333333336 | 11.21 |
| 44576.84375 | 11.23 |
| 44576.854166666664 | 11.29 |
| 44576.864583333336 | 11.33 |
| 44576.875 | 11.42 |
| 44576.885416666664 | 11.46 |
| 44576.895833333336 | 11.5 |
| 44576.90625 | 11.52 |
| 44576.916666666664 | 11.54 |
| 44576.927083333336 | 11.54 |
| 44576.9375 | 11.53 |
| 44576.947916666664 | 11.53 |
| 44576.958333333336 | 11.53 |
| 44576.96875 | 11.52 |
| 44576.979166666664 | 11.52 |
| 44576.989583333336 | 11.51 |
| 44577.0 | 11.49 |
| 44577.010416666664 | 11.48 |
| 44577.020833333336 | 11.47 |
| 44577.03125 | 11.46 |
| 44577.041666666664 | 11.45 |
| 44577.052083333336 | 11.43 |
| 44577.0625 | 11.41 |
| 44577.072916666664 | 11.38 |
| 44577.083333333336 | 11.33 |
| 44577.09375 | 11.3 |
| 44577.104166666664 | 11.29 |
| 44577.114583333336 | 11.24 |
| 44577.125 | 11.19 |
| 44577.135416666664 | 11.16 |
| 44577.145833333336 | 11.11 |
| 44577.15625 | 11.15 |
| 44577.166666666664 | 11.11 |
| 44577.177083333336 | 11.18 |
| 44577.1875 | 11.16 |
| 44577.197916666664 | 11.15 |
| 44577.208333333336 | 11.17 |
| 44577.21875 | 11.17 |
| 44577.229166666664 | 11.16 |
| 44577.239583333336 | 11.18 |
| 44577.25 | 11.19 |
| 44577.260416666664 | 11.18 |
| 44577.270833333336 | 11.14 |
| 44577.28125 | 11.13 |
| 44577.291666666664 | 11.12 |
| 44577.302083333336 | 11.12 |
| 44577.3125 | 11.11 |
| 44577.322916666664 | 11.12 |
| 44577.333333333336 | 11.13 |
| 44577.34375 | 11.13 |
| 44577.354166666664 | 11.12 |
| 44577.364583333336 | 11.12 |
| 44577.375 | 11.12 |
| 44577.385416666664 | 11.12 |
| 44577.395833333336 | 11.12 |
| 44577.40625 | 11.12 |
| 44577.416666666664 | 11.12 |
| 44577.427083333336 | 11.12 |
| 44577.4375 | 11.12 |
| 44577.447916666664 | 11.11 |
| 44577.458333333336 | 11.05 |
| 44577.46875 | 11.01 |
| 44577.479166666664 | 10.98 |
| 44577.489583333336 | 10.95 |
| 44577.5 | 10.93 |
| 44577.510416666664 | 10.92 |
| 44577.520833333336 | 10.91 |
| 44577.53125 | 10.9 |
| 44577.541666666664 | 10.9 |
| 44577.552083333336 | 10.91 |
| 44577.5625 | 10.95 |
| 44577.572916666664 | 10.97 |
| 44577.583333333336 | 11.01 |
| 44577.59375 | 11.02 |
| 44577.604166666664 | 11.06 |
| 44577.614583333336 | 11.11 |
| 44577.625 | 11.12 |
| 44577.635416666664 | 11.18 |
| 44577.645833333336 | 11.24 |
| 44577.65625 | 11.33 |
| 44577.666666666664 | 11.36 |
| 44577.677083333336 | 11.39 |
| 44577.6875 | 11.42 |
| 44577.697916666664 | 11.45 |
| 44577.708333333336 | 11.47 |
| 44577.71875 | 11.51 |
| 44577.729166666664 | 11.55 |
| 44577.739583333336 | 11.55 |
| 44577.75 | 11.55 |
| 44577.760416666664 | 11.53 |
| 44577.770833333336 | 11.56 |
| 44577.78125 | 11.55 |
| 44577.791666666664 | 11.56 |
| 44577.802083333336 | 11.55 |
| 44577.8125 | 11.56 |
| 44577.822916666664 | 11.56 |
| 44577.833333333336 | 11.55 |
| 44577.84375 | 11.55 |
| 44577.854166666664 | 11.54 |
| 44577.864583333336 | 11.52 |
| 44577.875 | 11.52 |
| 44577.885416666664 | 11.54 |
| 44577.895833333336 | 11.54 |
| 44577.90625 | 11.55 |
| 44577.916666666664 | 11.54 |
| 44577.927083333336 | 11.53 |
| 44577.9375 | 11.49 |
| 44577.947916666664 | 11.46 |
| 44577.958333333336 | 11.44 |
| 44577.96875 | 11.4 |
| 44577.979166666664 | 11.38 |
| 44577.989583333336 | 11.36 |
| 44578.0 | 11.37 |
| 44578.010416666664 | 11.37 |
| 44578.020833333336 | 11.35 |
| 44578.03125 | 11.33 |
| 44578.041666666664 | 11.3 |
| 44578.052083333336 | 11.25 |
| 44578.0625 | 11.13 |
| 44578.072916666664 | 11.06 |
| 44578.083333333336 | 11.03 |
| 44578.09375 | 10.99 |
| 44578.104166666664 | 10.95 |
| 44578.114583333336 | 10.89 |
| 44578.125 | 10.82 |
| 44578.135416666664 | 10.88 |
| 44578.145833333336 | 10.86 |
| 44578.15625 | 10.86 |
| 44578.166666666664 | 10.72 |
| 44578.177083333336 | 10.7 |
| 44578.1875 | 10.75 |
| 44578.197916666664 | 10.71 |
| 44578.208333333336 | 10.61 |
| 44578.21875 | 10.54 |
| 44578.229166666664 | 10.51 |
| 44578.239583333336 | 10.5 |
| 44578.25 | 10.43 |
| 44578.260416666664 | 10.42 |
| 44578.270833333336 | 10.39 |
| 44578.28125 | 10.4 |
| 44578.291666666664 | 10.42 |
| 44578.302083333336 | 10.41 |
| 44578.3125 | 10.42 |
| 44578.322916666664 | 10.4 |
| 44578.333333333336 | 10.43 |
| 44578.34375 | 10.43 |
| 44578.354166666664 | 10.42 |
| 44578.364583333336 | 10.42 |
| 44578.375 | 10.44 |
| 44578.385416666664 | 10.43 |
| 44578.395833333336 | 10.41 |
| 44578.40625 | 10.4 |
| 44578.416666666664 | 10.37 |
| 44578.427083333336 | 10.38 |
| 44578.4375 | 10.38 |
| 44578.447916666664 | 10.38 |
| 44578.458333333336 | 10.38 |
| 44578.46875 | 10.38 |
| 44578.479166666664 | 10.38 |
| 44578.489583333336 | 10.37 |
| 44578.5 | 10.37 |
| 44578.510416666664 | 10.36 |
| 44578.520833333336 | 10.36 |
| 44578.53125 | 10.36 |
| 44578.541666666664 | 10.35 |
| 44578.552083333336 | 10.36 |
| 44578.5625 | 10.36 |
| 44578.572916666664 | 10.37 |
| 44578.583333333336 | 10.38 |
| 44578.59375 | 10.4 |
| 44578.604166666664 | 10.41 |
| 44578.614583333336 | 10.42 |
| 44578.625 | 10.45 |
| 44578.635416666664 | 10.47 |
| 44578.645833333336 | 10.48 |
| 44578.65625 | 10.54 |
| 44578.666666666664 | 10.57 |
| 44578.677083333336 | 10.59 |
| 44578.6875 | 10.63 |
| 44578.697916666664 | 10.6 |
| 44578.708333333336 | 10.59 |
| 44578.71875 | 10.65 |
| 44578.729166666664 | 10.67 |
| 44578.739583333336 | 10.68 |
| 44578.75 | 10.7 |
| 44578.760416666664 | 10.7 |
| 44578.770833333336 | 10.7 |
| 44578.78125 | 10.72 |
| 44578.791666666664 | 10.73 |
| 44578.802083333336 | 10.73 |
| 44578.8125 | 10.75 |
| 44578.822916666664 | 10.74 |
| 44578.833333333336 | 10.72 |
| 44578.84375 | 10.76 |
| 44578.854166666664 | 10.75 |
| 44578.864583333336 | 10.7 |
| 44578.875 | 10.69 |
| 44578.885416666664 | 10.58 |
| 44578.895833333336 | 10.5 |
| 44578.90625 | 10.48 |
| 44578.916666666664 | 10.5 |
| 44578.927083333336 | 10.47 |
| 44578.9375 | 10.41 |
| 44578.947916666664 | 10.36 |
| 44578.958333333336 | 10.33 |
| 44578.96875 | 10.28 |
| 44578.979166666664 | 10.25 |
| 44578.989583333336 | 10.23 |
| 44579.0 | 10.2 |
| 44579.010416666664 | 10.18 |
| 44579.020833333336 | 10.16 |
| 44579.03125 | 10.16 |
| 44579.041666666664 | 10.16 |
| 44579.052083333336 | 10.15 |
| 44579.0625 | 10.15 |
| 44579.072916666664 | 10.17 |
| 44579.083333333336 | 10.16 |
| 44579.09375 | 10.15 |
| 44579.104166666664 | 10.14 |
| 44579.114583333336 | 10.13 |
| 44579.125 | 10.12 |
| 44579.135416666664 | 10.11 |
| 44579.145833333336 | 10.12 |
| 44579.15625 | 10.2 |
| 44579.166666666664 | 10.25 |
| 44579.177083333336 | 10.28 |
| 44579.1875 | 10.33 |
| 44579.197916666664 | 10.34 |
| 44579.208333333336 | 10.36 |
| 44579.21875 | 10.37 |
| 44579.229166666664 | 10.4 |
| 44579.239583333336 | 10.39 |
| 44579.25 | 10.39 |
| 44579.260416666664 | 10.4 |
| 44579.270833333336 | 10.36 |
| 44579.28125 | 10.46 |
| 44579.291666666664 | 10.45 |
| 44579.302083333336 | 10.51 |
| 44579.3125 | 10.39 |
| 44579.322916666664 | 10.38 |
| 44579.333333333336 | 10.39 |
| 44579.34375 | 10.31 |
| 44579.354166666664 | 10.3 |
| 44579.364583333336 | 10.31 |
| 44579.375 | 10.28 |
| 44579.385416666664 | 10.22 |
| 44579.395833333336 | 10.2 |
| 44579.40625 | 10.19 |
| 44579.416666666664 | 10.22 |
| 44579.427083333336 | 10.26 |
| 44579.4375 | 10.29 |
| 44579.447916666664 | 10.3 |
| 44579.458333333336 | 10.32 |
| 44579.46875 | 10.34 |
| 44579.479166666664 | 10.36 |
| 44579.489583333336 | 10.36 |
| 44579.5 | 10.36 |
| 44579.510416666664 | 10.33 |
| 44579.520833333336 | 10.33 |
| 44579.53125 | 10.32 |
| 44579.541666666664 | 10.31 |
| 44579.552083333336 | 10.31 |
| 44579.5625 | 10.31 |
| 44579.572916666664 | 10.32 |
| 44579.583333333336 | 10.32 |
| 44579.59375 | 10.33 |
| 44579.604166666664 | 10.36 |
| 44579.614583333336 | 10.36 |
| 44579.625 | 10.44 |
| 44579.635416666664 | 10.47 |
| 44579.645833333336 | 10.51 |
| 44579.65625 | 10.55 |
| 44579.666666666664 | 10.58 |
| 44579.677083333336 | 10.64 |
| 44579.6875 | 10.65 |
| 44579.697916666664 | 10.74 |
| 44579.708333333336 | 10.84 |
| 44579.71875 | 10.88 |
| 44579.729166666664 | 10.92 |
| 44579.739583333336 | 10.97 |
| 44579.75 | 11.04 |
| 44579.760416666664 | 11.08 |
| 44579.770833333336 | 11.11 |
| 44579.78125 | 11.13 |
| 44579.791666666664 | 11.16 |
| 44579.802083333336 | 11.21 |
| 44579.8125 | 11.25 |
| 44579.822916666664 | 11.26 |
| 44579.833333333336 | 11.31 |
| 44579.84375 | 11.34 |
| 44579.854166666664 | 11.33 |
| 44579.864583333336 | 11.31 |
| 44579.875 | 11.28 |
| 44579.885416666664 | 11.25 |
| 44579.895833333336 | 11.21 |
| 44579.90625 | 11.16 |
| 44579.916666666664 | 11.12 |
| 44579.927083333336 | 11.16 |
| 44579.9375 | 11.14 |
| 44579.947916666664 | 11.12 |
| 44579.958333333336 | 11.25 |
| 44579.96875 | 11.26 |
| 44579.979166666664 | 11.23 |
| 44579.989583333336 | 11.21 |
| 44580.0 | 11.18 |
| 44580.010416666664 | 11.13 |
| 44580.020833333336 | 11.05 |
| 44580.03125 | 10.97 |
| 44580.041666666664 | 10.91 |
| 44580.052083333336 | 10.88 |
| 44580.0625 | 10.85 |
| 44580.072916666664 | 10.84 |
| 44580.083333333336 | 10.82 |
| 44580.09375 | 10.78 |
| 44580.104166666664 | 10.79 |
| 44580.114583333336 | 10.8 |
| 44580.125 | 10.81 |
| 44580.135416666664 | 10.81 |
| 44580.145833333336 | 10.81 |
| 44580.15625 | 10.82 |
| 44580.166666666664 | 10.84 |
| 44580.177083333336 | 10.87 |
| 44580.1875 | 10.92 |
| 44580.197916666664 | 10.98 |
| 44580.208333333336 | 11.01 |
| 44580.21875 | 10.99 |
| 44580.229166666664 | 10.97 |
| 44580.239583333336 | 10.94 |
| 44580.25 | 10.91 |
| 44580.260416666664 | 10.89 |
| 44580.270833333336 | 10.88 |
| 44580.28125 | 10.85 |
| 44580.291666666664 | 10.86 |
| 44580.302083333336 | 10.85 |
| 44580.3125 | 10.8 |
| 44580.322916666664 | 10.85 |
| 44580.333333333336 | 10.85 |
| 44580.34375 | 10.84 |
| 44580.354166666664 | 10.81 |
| 44580.364583333336 | 10.8 |
| 44580.375 | 10.8 |
| 44580.385416666664 | 10.79 |
| 44580.395833333336 | 10.76 |
| 44580.40625 | 10.73 |
| 44580.416666666664 | 10.73 |
| 44580.427083333336 | 10.7 |
| 44580.4375 | 10.65 |
| 44580.447916666664 | 10.61 |
| 44580.458333333336 | 10.57 |
| 44580.46875 | 10.51 |
| 44580.479166666664 | 10.45 |
| 44580.489583333336 | 10.42 |
| 44580.5 | 10.4 |
| 44580.510416666664 | 10.39 |
| 44580.520833333336 | 10.39 |
| 44580.53125 | 10.41 |
| 44580.541666666664 | 10.42 |
| 44580.552083333336 | 10.44 |
| 44580.5625 | 10.45 |
| 44580.572916666664 | 10.47 |
| 44580.583333333336 | 10.49 |
| 44580.59375 | 10.52 |
| 44580.604166666664 | 10.54 |
| 44580.614583333336 | 10.57 |
| 44580.625 | 10.59 |
| 44580.635416666664 | 10.6 |
| 44580.645833333336 | 10.7 |
| 44580.65625 | 10.85 |
| 44580.666666666664 | 10.84 |
| 44580.677083333336 | 10.94 |
| 44580.6875 | 10.98 |
| 44580.697916666664 | 11.01 |
| 44580.708333333336 | 11.03 |
| 44580.71875 | 11.08 |
| 44580.729166666664 | 11.16 |
| 44580.739583333336 | 11.28 |
| 44580.75 | 11.35 |
| 44580.760416666664 | 11.38 |
| 44580.770833333336 | 11.41 |
| 44580.78125 | 11.43 |
| 44580.791666666664 | 11.43 |
| 44580.802083333336 | 11.46 |
| 44580.8125 | 11.48 |
| 44580.833333333336 | 10.61 |
| 44580.84375 | 11.52 |
| 44580.854166666664 | 11.53 |
| 44580.864583333336 | 11.53 |
| 44580.875 | 11.55 |
| 44580.885416666664 | 11.55 |
| 44580.895833333336 | 11.51 |
| 44580.90625 | 11.47 |
| 44580.916666666664 | 11.43 |
| 44580.927083333336 | 11.41 |
| 44580.9375 | 11.36 |
| 44580.947916666664 | 11.34 |
| 44580.958333333336 | 11.32 |
| 44580.96875 | 11.3 |
| 44580.979166666664 | 11.26 |
| 44580.989583333336 | 11.18 |
| 44581.0 | 11.12 |
| 44581.010416666664 | 11.06 |
| 44581.020833333336 | 10.98 |
| 44581.03125 | 10.89 |
| 44581.041666666664 | 10.78 |
| 44581.052083333336 | 10.71 |
| 44581.0625 | 10.67 |
| 44581.072916666664 | 10.64 |
| 44581.083333333336 | 10.62 |
| 44581.09375 | 10.62 |
| 44581.104166666664 | 10.61 |
| 44581.114583333336 | 10.61 |
| 44581.125 | 10.61 |
| 44581.135416666664 | 10.62 |
| 44581.145833333336 | 10.61 |
| 44581.15625 | 10.61 |
| 44581.166666666664 | 10.57 |
| 44581.177083333336 | 10.54 |
| 44581.1875 | 10.53 |
| 44581.197916666664 | 10.53 |
| 44581.208333333336 | 10.53 |
| 44581.21875 | 10.64 |
| 44581.229166666664 | 10.69 |
| 44581.239583333336 | 10.78 |
| 44581.25 | 10.85 |
| 44581.260416666664 | 10.82 |
| 44581.270833333336 | 10.77 |
| 44581.28125 | 10.78 |
| 44581.291666666664 | 10.78 |
| 44581.302083333336 | 10.75 |
| 44581.3125 | 10.7 |
| 44581.322916666664 | 10.67 |
| 44581.333333333336 | 10.64 |
| 44581.34375 | 10.61 |
| 44581.354166666664 | 10.7 |
| 44581.364583333336 | 10.66 |
| 44581.375 | 10.65 |
| 44581.385416666664 | 10.67 |
| 44581.395833333336 | 10.67 |
| 44581.40625 | 10.63 |
| 44581.416666666664 | 10.61 |
| 44581.427083333336 | 10.55 |
| 44581.4375 | 10.51 |
| 44581.447916666664 | 10.45 |
| 44581.458333333336 | 10.37 |
| 44581.46875 | 10.27 |
| 44581.479166666664 | 10.16 |
| 44581.489583333336 | 10.08 |
| 44581.5 | 10.01 |
| 44581.510416666664 | 9.98 |
| 44581.520833333336 | 9.98 |
| 44581.53125 | 10 |
| 44581.541666666664 | 10.05 |
| 44581.552083333336 | 10.11 |
| 44581.5625 | 10.18 |
| 44581.572916666664 | 10.25 |
| 44581.583333333336 | 10.29 |
| 44581.59375 | 10.33 |
| 44581.604166666664 | 10.37 |
| 44581.614583333336 | 10.4 |
| 44581.625 | 10.42 |
| 44581.635416666664 | 10.43 |
| 44581.645833333336 | 10.42 |
| 44581.65625 | 10.46 |
| 44581.666666666664 | 10.5 |
| 44581.677083333336 | 10.52 |
| 44581.6875 | 10.57 |
| 44581.697916666664 | 10.61 |
| 44581.708333333336 | 10.64 |
| 44581.71875 | 10.65 |
| 44581.729166666664 | 10.66 |
| 44581.739583333336 | 10.68 |
| 44581.75 | 10.72 |
| 44581.760416666664 | 10.75 |
| 44581.770833333336 | 10.79 |
| 44581.78125 | 10.86 |
| 44581.791666666664 | 10.93 |
| 44581.802083333336 | 11 |
| 44581.8125 | 11.04 |
| 44581.822916666664 | 11.07 |
| 44581.833333333336 | 11.08 |
| 44581.84375 | 11.1 |
| 44581.854166666664 | 11.1 |
| 44581.864583333336 | 11.09 |
| 44581.875 | 11.07 |
| 44581.885416666664 | 11.09 |
| 44581.895833333336 | 11.09 |
| 44581.90625 | 11.07 |
| 44581.916666666664 | 11.03 |
| 44581.927083333336 | 10.98 |
| 44581.9375 | 10.97 |
| 44581.947916666664 | 10.93 |
| 44581.958333333336 | 10.91 |
| 44581.96875 | 10.88 |
| 44581.979166666664 | 10.86 |
| 44581.989583333336 | 10.82 |
| 44582.0 | 10.79 |
| 44582.010416666664 | 10.76 |
| 44582.020833333336 | 10.73 |
| 44582.03125 | 10.69 |
| 44582.041666666664 | 10.67 |
| 44582.052083333336 | 10.63 |
| 44582.0625 | 10.61 |
| 44582.072916666664 | 10.61 |
| 44582.083333333336 | 10.6 |
| 44582.09375 | 10.6 |
| 44582.104166666664 | 10.61 |
| 44582.114583333336 | 10.62 |
| 44582.125 | 10.63 |
| 44582.135416666664 | 10.63 |
| 44582.145833333336 | 10.62 |
| 44582.15625 | 10.6 |
| 44582.166666666664 | 10.6 |
| 44582.177083333336 | 10.6 |
| 44582.1875 | 10.59 |
| 44582.197916666664 | 10.58 |
| 44582.208333333336 | 10.55 |
| 44582.21875 | 10.54 |
| 44582.229166666664 | 10.51 |
| 44582.239583333336 | 10.49 |
| 44582.25 | 10.48 |
| 44582.260416666664 | 10.45 |
| 44582.270833333336 | 10.47 |
| 44582.28125 | 10.52 |
| 44582.291666666664 | 10.57 |
| 44582.302083333336 | 10.56 |
| 44582.3125 | 10.53 |
| 44582.322916666664 | 10.54 |
| 44582.333333333336 | 10.53 |
| 44582.34375 | 10.55 |
| 44582.354166666664 | 10.57 |
| 44582.364583333336 | 10.6 |
| 44582.375 | 10.63 |
| 44582.385416666664 | 10.63 |
| 44582.395833333336 | 10.61 |
| 44582.40625 | 10.61 |
| 44582.416666666664 | 10.58 |
| 44582.427083333336 | 10.56 |
| 44582.4375 | 10.54 |
| 44582.447916666664 | 10.52 |
| 44582.458333333336 | 10.51 |
| 44582.46875 | 10.49 |
| 44582.479166666664 | 10.49 |
| 44582.489583333336 | 10.5 |
| 44582.5 | 10.5 |
| 44582.510416666664 | 10.51 |
| 44582.520833333336 | 10.52 |
| 44582.53125 | 10.52 |
| 44582.541666666664 | 10.52 |
| 44582.552083333336 | 10.53 |
| 44582.5625 | 10.54 |
| 44582.572916666664 | 10.55 |
| 44582.583333333336 | 10.57 |
| 44582.59375 | 10.58 |
| 44582.604166666664 | 10.59 |
| 44582.614583333336 | 10.6 |
| 44582.625 | 10.61 |
| 44582.635416666664 | 10.63 |
| 44582.645833333336 | 10.64 |
| 44582.65625 | 10.66 |
| 44582.666666666664 | 10.68 |
| 44582.677083333336 | 10.7 |
| 44582.6875 | 10.71 |
| 44582.697916666664 | 10.77 |
| 44582.708333333336 | 10.81 |
| 44582.71875 | 10.86 |
| 44582.729166666664 | 10.89 |
| 44582.739583333336 | 10.94 |
| 44582.75 | 11 |
| 44582.760416666664 | 11.05 |
| 44582.770833333336 | 11.13 |
| 44582.78125 | 11.2 |
| 44582.791666666664 | 11.28 |
| 44582.802083333336 | 11.39 |
| 44582.8125 | 11.48 |
| 44582.822916666664 | 11.52 |
| 44582.833333333336 | 11.61 |
| 44582.84375 | 11.63 |
| 44582.854166666664 | 11.66 |
| 44582.864583333336 | 11.61 |
| 44582.875 | 11.67 |
| 44582.885416666664 | 11.7 |
| 44582.895833333336 | 11.69 |
| 44582.90625 | 11.71 |
| 44582.916666666664 | 11.73 |
| 44582.927083333336 | 11.72 |
| 44582.9375 | 11.71 |
| 44582.947916666664 | 11.69 |
| 44582.958333333336 | 11.66 |
| 44582.96875 | 11.6 |
| 44582.979166666664 | 11.58 |
| 44582.989583333336 | 11.54 |
| 44583.0 | 11.5 |
| 44583.010416666664 | 11.46 |
| 44583.020833333336 | 11.44 |
| 44583.03125 | 11.43 |
| 44583.041666666664 | 11.42 |
| 44583.052083333336 | 11.39 |
| 44583.0625 | 11.37 |
| 44583.072916666664 | 11.36 |
| 44583.083333333336 | 11.33 |
| 44583.09375 | 11.32 |
| 44583.104166666664 | 11.29 |
| 44583.114583333336 | 11.28 |
| 44583.125 | 11.27 |
| 44583.135416666664 | 11.25 |
| 44583.145833333336 | 11.23 |
| 44583.15625 | 11.22 |
| 44583.166666666664 | 11.2 |
| 44583.177083333336 | 11.2 |
| 44583.1875 | 11.18 |
| 44583.197916666664 | 11.15 |
| 44583.208333333336 | 11.16 |
| 44583.21875 | 11.15 |
| 44583.229166666664 | 11.15 |
| 44583.239583333336 | 11.15 |
| 44583.25 | 11.16 |
| 44583.260416666664 | 11.18 |
| 44583.270833333336 | 11.18 |
| 44583.28125 | 11.19 |
| 44583.291666666664 | 11.2 |
| 44583.302083333336 | 11.23 |
| 44583.3125 | 11.23 |
| 44583.322916666664 | 11.23 |
| 44583.333333333336 | 11.22 |
| 44583.34375 | 11.23 |
| 44583.354166666664 | 11.3 |
| 44583.364583333336 | 11.31 |
| 44583.375 | 11.34 |
| 44583.385416666664 | 11.36 |
| 44583.395833333336 | 11.38 |
| 44583.40625 | 11.4 |
| 44583.416666666664 | 11.41 |
| 44583.427083333336 | 11.41 |
| 44583.4375 | 11.42 |
| 44583.447916666664 | 11.42 |
| 44583.458333333336 | 11.35 |
| 44583.46875 | 11.33 |
| 44583.479166666664 | 11.33 |
| 44583.489583333336 | 11.32 |
| 44583.5 | 11.29 |
| 44583.510416666664 | 11.26 |
| 44583.520833333336 | 11.23 |
| 44583.53125 | 11.21 |
| 44583.541666666664 | 11.22 |
| 44583.552083333336 | 11.23 |
| 44583.5625 | 11.24 |
| 44583.572916666664 | 11.26 |
| 44583.583333333336 | 11.29 |
| 44583.59375 | 11.32 |
| 44583.604166666664 | 11.34 |
| 44583.614583333336 | 11.34 |
| 44583.625 | 11.36 |
| 44583.635416666664 | 11.38 |
| 44583.645833333336 | 11.39 |
| 44583.65625 | 11.38 |
| 44583.666666666664 | 11.38 |
| 44583.677083333336 | 11.39 |
| 44583.6875 | 11.41 |
| 44583.697916666664 | 11.45 |
| 44583.708333333336 | 11.43 |
| 44583.71875 | 11.47 |
| 44583.729166666664 | 11.53 |
| 44583.739583333336 | 11.59 |
| 44583.75 | 11.64 |
| 44583.760416666664 | 11.67 |
| 44583.770833333336 | 11.7 |
| 44583.78125 | 11.73 |
| 44583.791666666664 | 11.83 |
| 44583.802083333336 | 11.81 |
| 44583.8125 | 11.88 |
| 44583.822916666664 | 11.94 |
| 44583.833333333336 | 11.96 |
| 44583.84375 | 12.03 |
| 44583.854166666664 | 12.08 |
| 44583.864583333336 | 12.12 |
| 44583.875 | 12.23 |
| 44583.885416666664 | 12.25 |
| 44583.895833333336 | 12.3 |
| 44583.90625 | 12.27 |
| 44583.916666666664 | 12.29 |
| 44583.927083333336 | 12.33 |
| 44583.9375 | 12.34 |
| 44583.947916666664 | 12.34 |
| 44583.958333333336 | 12.34 |
| 44583.96875 | 12.3 |
| 44583.979166666664 | 12.27 |
| 44583.989583333336 | 12.25 |
| 44584.0 | 12.22 |
| 44584.010416666664 | 12.17 |
| 44584.020833333336 | 12.14 |
| 44584.03125 | 12.11 |
| 44584.041666666664 | 12.07 |
| 44584.052083333336 | 12.03 |
| 44584.0625 | 11.96 |
| 44584.072916666664 | 11.94 |
| 44584.083333333336 | 11.94 |
| 44584.09375 | 11.92 |
| 44584.104166666664 | 11.91 |
| 44584.114583333336 | 11.92 |
| 44584.125 | 11.91 |
| 44584.135416666664 | 11.9 |
| 44584.145833333336 | 11.89 |
| 44584.15625 | 11.87 |
| 44584.166666666664 | 11.86 |
| 44584.177083333336 | 11.84 |
| 44584.1875 | 11.81 |
| 44584.197916666664 | 11.79 |
| 44584.208333333336 | 11.74 |
| 44584.21875 | 11.66 |
| 44584.229166666664 | 11.7 |
| 44584.239583333336 | 11.72 |
| 44584.25 | 11.75 |
| 44584.260416666664 | 11.73 |
| 44584.270833333336 | 11.73 |
| 44584.28125 | 11.73 |
| 44584.291666666664 | 11.73 |
| 44584.302083333336 | 11.71 |
| 44584.3125 | 11.71 |
| 44584.322916666664 | 11.68 |
| 44584.333333333336 | 11.64 |
| 44584.34375 | 11.67 |
| 44584.354166666664 | 11.67 |
| 44584.364583333336 | 11.68 |
| 44584.375 | 11.79 |
| 44584.385416666664 | 11.8 |
| 44584.395833333336 | 11.83 |
| 44584.40625 | 11.84 |
| 44584.416666666664 | 11.83 |
| 44584.427083333336 | 11.86 |
| 44584.4375 | 11.89 |
| 44584.447916666664 | 11.91 |
| 44584.458333333336 | 11.91 |
| 44584.46875 | 11.91 |
| 44584.479166666664 | 11.86 |
| 44584.489583333336 | 11.85 |
| 44584.5 | 11.83 |
| 44584.510416666664 | 11.8 |
| 44584.520833333336 | 11.78 |
| 44584.53125 | 11.76 |
| 44584.541666666664 | 11.68 |
| 44584.552083333336 | 11.64 |
| 44584.5625 | 11.63 |
| 44584.572916666664 | 11.62 |
| 44584.583333333336 | 11.61 |
| 44584.59375 | 11.62 |
| 44584.604166666664 | 11.64 |
| 44584.614583333336 | 11.68 |
| 44584.625 | 11.72 |
| 44584.635416666664 | 11.77 |
| 44584.645833333336 | 11.8 |
| 44584.65625 | 11.82 |
| 44584.666666666664 | 11.83 |
| 44584.677083333336 | 11.84 |
| 44584.6875 | 11.84 |
| 44584.697916666664 | 11.86 |
| 44584.708333333336 | 11.89 |
| 44584.71875 | 11.91 |
| 44584.729166666664 | 11.94 |
| 44584.739583333336 | 11.99 |
| 44584.75 | 12 |
| 44584.760416666664 | 12.08 |
| 44584.770833333336 | 12.12 |
| 44584.78125 | 12.15 |
| 44584.791666666664 | 12.16 |
| 44584.802083333336 | 12.19 |
| 44584.8125 | 12.21 |
| 44584.822916666664 | 12.24 |
| 44584.833333333336 | 12.29 |
| 44584.84375 | 12.35 |
| 44584.854166666664 | 12.38 |
| 44584.864583333336 | 12.4 |
| 44584.875 | 12.54 |
| 44584.885416666664 | 12.54 |
| 44584.895833333336 | 12.51 |
| 44584.90625 | 12.53 |
| 44584.916666666664 | 12.57 |
| 44584.927083333336 | 12.57 |
| 44584.9375 | 12.55 |
| 44584.947916666664 | 12.58 |
| 44584.958333333336 | 12.61 |
| 44584.96875 | 12.64 |
| 44584.979166666664 | 12.64 |
| 44584.989583333336 | 12.62 |
| 44585.0 | 12.58 |
| 44585.010416666664 | 12.55 |
| 44585.020833333336 | 12.51 |
| 44585.03125 | 12.46 |
| 44585.041666666664 | 12.41 |
| 44585.052083333336 | 12.36 |
| 44585.0625 | 12.31 |
| 44585.072916666664 | 12.24 |
| 44585.083333333336 | 12.19 |
| 44585.09375 | 12.14 |
| 44585.104166666664 | 12.12 |
| 44585.114583333336 | 12.11 |
| 44585.125 | 12.1 |
| 44585.135416666664 | 12.1 |
| 44585.145833333336 | 12.09 |
| 44585.15625 | 12.08 |
| 44585.166666666664 | 12.07 |
| 44585.177083333336 | 12.06 |
| 44585.1875 | 12.06 |
| 44585.197916666664 | 12.04 |
| 44585.208333333336 | 12.03 |
| 44585.21875 | 12.01 |
| 44585.229166666664 | 11.99 |
| 44585.239583333336 | 11.98 |
| 44585.25 | 11.96 |
| 44585.260416666664 | 11.98 |
| 44585.270833333336 | 11.96 |
| 44585.28125 | 11.95 |
| 44585.291666666664 | 11.94 |
| 44585.302083333336 | 11.93 |
| 44585.3125 | 11.9 |
| 44585.322916666664 | 11.89 |
| 44585.333333333336 | 11.86 |
| 44585.34375 | 11.84 |
| 44585.354166666664 | 11.81 |
| 44585.364583333336 | 11.78 |
| 44585.375 | 11.76 |
| 44585.385416666664 | 11.78 |
| 44585.395833333336 | 11.77 |
| 44585.40625 | 11.8 |
| 44585.416666666664 | 11.89 |
| 44585.427083333336 | 11.94 |
| 44585.4375 | 11.98 |
| 44585.447916666664 | 12.03 |
| 44585.458333333336 | 12.04 |
| 44585.46875 | 12.05 |
| 44585.479166666664 | 12.04 |
| 44585.489583333336 | 12.02 |
| 44585.5 | 12 |
| 44585.510416666664 | 11.94 |
| 44585.520833333336 | 11.94 |
| 44585.53125 | 11.93 |
| 44585.541666666664 | 11.91 |
| 44585.552083333336 | 11.89 |
| 44585.5625 | 11.87 |
| 44585.572916666664 | 11.85 |
| 44585.583333333336 | 11.81 |
| 44585.59375 | 11.82 |
| 44585.604166666664 | 11.85 |
| 44585.614583333336 | 11.87 |
| 44585.625 | 11.9 |
| 44585.635416666664 | 11.93 |
| 44585.645833333336 | 11.97 |
| 44585.65625 | 12.01 |
| 44585.666666666664 | 12.04 |
| 44585.677083333336 | 12.09 |
| 44585.6875 | 12.11 |
| 44585.697916666664 | 12.14 |
| 44585.708333333336 | 12.15 |
| 44585.71875 | 12.16 |
| 44585.729166666664 | 12.17 |
| 44585.739583333336 | 12.18 |
| 44585.75 | 12.21 |
| 44585.760416666664 | 12.21 |
| 44585.770833333336 | 12.27 |
| 44585.78125 | 12.32 |
| 44585.791666666664 | 12.39 |
| 44585.802083333336 | 12.35 |
| 44585.8125 | 12.34 |
| 44585.822916666664 | 12.36 |
| 44585.833333333336 | 12.37 |
| 44585.84375 | 12.38 |
| 44585.854166666664 | 12.44 |
| 44585.864583333336 | 12.49 |
| 44585.875 | 12.53 |
| 44585.885416666664 | 12.54 |
| 44585.895833333336 | 12.64 |
| 44585.90625 | 12.66 |
| 44585.916666666664 | 12.63 |
| 44585.927083333336 | 12.59 |
| 44585.9375 | 12.61 |
| 44585.947916666664 | 12.61 |
| 44585.958333333336 | 12.64 |
| 44585.96875 | 12.68 |
| 44585.979166666664 | 12.68 |
| 44585.989583333336 | 12.7 |
| 44586.0 | 12.71 |
| 44586.010416666664 | 12.7 |
| 44586.020833333336 | 12.73 |
| 44586.03125 | 12.71 |
| 44586.041666666664 | 12.63 |
| 44586.052083333336 | 12.62 |
| 44586.0625 | 12.58 |
| 44586.072916666664 | 12.53 |
| 44586.083333333336 | 12.49 |
| 44586.09375 | 12.44 |
| 44586.104166666664 | 12.38 |
| 44586.114583333336 | 12.32 |
| 44586.125 | 12.22 |
| 44586.135416666664 | 12.17 |
| 44586.145833333336 | 12.13 |
| 44586.15625 | 12.11 |
| 44586.166666666664 | 12.1 |
| 44586.177083333336 | 12.07 |
| 44586.1875 | 12.07 |
| 44586.197916666664 | 12.05 |
| 44586.208333333336 | 12.05 |
| 44586.21875 | 12.04 |
| 44586.229166666664 | 12.04 |
| 44586.239583333336 | 12.03 |
| 44586.25 | 12.01 |
| 44586.260416666664 | 12 |
| 44586.270833333336 | 11.99 |
| 44586.28125 | 11.98 |
| 44586.291666666664 | 11.95 |
| 44586.302083333336 | 11.96 |
| 44586.3125 | 11.89 |
| 44586.322916666664 | 11.88 |
| 44586.333333333336 | 11.83 |
| 44586.34375 | 11.76 |
| 44586.354166666664 | 11.78 |
| 44586.364583333336 | 11.76 |
| 44586.375 | 11.74 |
| 44586.385416666664 | 11.69 |
| 44586.395833333336 | 11.6 |
| 44586.40625 | 11.52 |
| 44586.416666666664 | 11.5 |
| 44586.427083333336 | 11.56 |
| 44586.4375 | 11.45 |
| 44586.447916666664 | 11.57 |
| 44586.458333333336 | 11.63 |
| 44586.46875 | 11.6 |
| 44586.479166666664 | 11.64 |
| 44586.489583333336 | 11.68 |
| 44586.5 | 11.7 |
| 44586.510416666664 | 11.73 |
| 44586.520833333336 | 11.74 |
| 44586.53125 | 11.75 |
| 44586.541666666664 | 11.73 |
| 44586.552083333336 | 11.71 |
| 44586.5625 | 11.72 |
| 44586.572916666664 | 11.73 |
| 44586.583333333336 | 11.75 |
| 44586.59375 | 11.74 |
| 44586.604166666664 | 11.73 |
| 44586.614583333336 | 11.71 |
| 44586.625 | 11.72 |
| 44586.635416666664 | 11.74 |
| 44586.645833333336 | 11.78 |
| 44586.65625 | 11.81 |
| 44586.666666666664 | 11.84 |
| 44586.677083333336 | 11.87 |
| 44586.6875 | 11.91 |
| 44586.697916666664 | 11.96 |
| 44586.708333333336 | 11.99 |
| 44586.71875 | 12.02 |
| 44586.729166666664 | 12.07 |
| 44586.739583333336 | 12.09 |
| 44586.75 | 12.13 |
| 44586.760416666664 | 12.16 |
| 44586.770833333336 | 12.19 |
| 44586.78125 | 12.18 |
| 44586.791666666664 | 12.17 |
| 44586.802083333336 | 12.2 |
| 44586.8125 | 12.28 |
| 44586.822916666664 | 12.31 |
| 44586.833333333336 | 12.37 |
| 44586.84375 | 12.43 |
| 44586.854166666664 | 12.47 |
| 44586.864583333336 | 12.48 |
| 44586.875 | 12.46 |
| 44586.885416666664 | 12.57 |
| 44586.895833333336 | 12.61 |
| 44586.90625 | 12.64 |
| 44586.916666666664 | 12.65 |
| 44586.927083333336 | 12.66 |
| 44586.9375 | 12.7 |
| 44586.947916666664 | 12.75 |
| 44586.958333333336 | 12.8 |
| 44586.96875 | 12.83 |
| 44586.979166666664 | 12.84 |
| 44586.989583333336 | 12.85 |
| 44587.0 | 12.85 |
| 44587.010416666664 | 12.85 |
| 44587.020833333336 | 12.85 |
| 44587.03125 | 12.85 |
| 44587.041666666664 | 12.8 |
| 44587.052083333336 | 12.81 |
| 44587.0625 | 12.78 |
| 44587.072916666664 | 12.73 |
| 44587.083333333336 | 12.71 |
| 44587.09375 | 12.67 |
| 44587.104166666664 | 12.65 |
| 44587.114583333336 | 12.57 |
| 44587.125 | 12.43 |
| 44587.135416666664 | 12.36 |
| 44587.145833333336 | 12.31 |
| 44587.15625 | 12.23 |
| 44587.166666666664 | 12.14 |
| 44587.177083333336 | 12.07 |
| 44587.1875 | 12 |
| 44587.197916666664 | 11.96 |
| 44587.208333333336 | 11.93 |
| 44587.21875 | 11.91 |
| 44587.229166666664 | 11.89 |
| 44587.239583333336 | 11.86 |
| 44587.25 | 11.82 |
| 44587.260416666664 | 11.8 |
| 44587.270833333336 | 11.79 |
| 44587.28125 | 11.78 |
| 44587.291666666664 | 11.77 |
| 44587.302083333336 | 11.75 |
| 44587.3125 | 11.74 |
| 44587.322916666664 | 11.72 |
| 44587.333333333336 | 11.7 |
| 44587.34375 | 11.7 |
| 44587.354166666664 | 11.7 |
| 44587.364583333336 | 11.69 |
| 44587.375 | 11.67 |
| 44587.385416666664 | 11.65 |
| 44587.395833333336 | 11.62 |
| 44587.40625 | 11.59 |
| 44587.416666666664 | 11.55 |
| 44587.427083333336 | 11.55 |
| 44587.4375 | 11.51 |
| 44587.447916666664 | 11.47 |
| 44587.458333333336 | 11.42 |
| 44587.46875 | 11.35 |
| 44587.479166666664 | 11.28 |
| 44587.489583333336 | 11.28 |
| 44587.5 | 11.33 |
| 44587.510416666664 | 11.36 |
| 44587.520833333336 | 11.33 |
| 44587.53125 | 11.33 |
| 44587.541666666664 | 11.37 |
| 44587.552083333336 | 11.39 |
| 44587.5625 | 11.42 |
| 44587.572916666664 | 11.44 |
| 44587.583333333336 | 11.49 |
| 44587.59375 | 11.51 |
| 44587.604166666664 | 11.52 |
| 44587.614583333336 | 11.55 |
| 44587.625 | 11.56 |
| 44587.635416666664 | 11.58 |
| 44587.645833333336 | 11.6 |
| 44587.65625 | 11.6 |
| 44587.666666666664 | 11.59 |
| 44587.677083333336 | 11.6 |
| 44587.6875 | 11.63 |
| 44587.697916666664 | 11.68 |
| 44587.708333333336 | 11.72 |
| 44587.71875 | 11.76 |
| 44587.729166666664 | 11.78 |
| 44587.739583333336 | 11.8 |
| 44587.75 | 11.81 |
| 44587.760416666664 | 11.82 |
| 44587.770833333336 | 11.82 |
| 44587.78125 | 11.81 |
| 44587.791666666664 | 11.81 |
| 44587.802083333336 | 11.8 |
| 44587.8125 | 11.81 |
| 44587.822916666664 | 11.83 |
| 44587.833333333336 | 11.83 |
| 44587.84375 | 11.79 |
| 44587.854166666664 | 11.89 |
| 44587.864583333336 | 11.91 |
| 44587.875 | 11.9 |
| 44587.885416666664 | 11.93 |
| 44587.895833333336 | 11.95 |
| 44587.90625 | 11.98 |
| 44587.916666666664 | 12.02 |
| 44587.927083333336 | 12.04 |
| 44587.9375 | 12.04 |
| 44587.947916666664 | 11.99 |
| 44587.958333333336 | 11.98 |
| 44587.96875 | 11.99 |
| 44587.979166666664 | 11.98 |
| 44587.989583333336 | 11.97 |
| 44588.0 | 11.98 |
| 44588.010416666664 | 12.01 |
| 44588.020833333336 | 12.03 |
| 44588.03125 | 12.05 |
| 44588.041666666664 | 12.08 |
| 44588.052083333336 | 12.08 |
| 44588.0625 | 12.08 |
| 44588.072916666664 | 12.08 |
| 44588.083333333336 | 12.08 |
| 44588.09375 | 12.07 |
| 44588.104166666664 | 12.07 |
| 44588.114583333336 | 12.01 |
| 44588.125 | 11.99 |
| 44588.135416666664 | 11.96 |
| 44588.145833333336 | 11.95 |
| 44588.15625 | 11.93 |
| 44588.166666666664 | 11.86 |
| 44588.177083333336 | 11.78 |
| 44588.1875 | 11.73 |
| 44588.197916666664 | 11.68 |
| 44588.208333333336 | 11.64 |
| 44588.21875 | 11.6 |
| 44588.229166666664 | 11.58 |
| 44588.239583333336 | 11.56 |
| 44588.25 | 11.53 |
| 44588.260416666664 | 11.51 |
| 44588.270833333336 | 11.48 |
| 44588.28125 | 11.45 |
| 44588.291666666664 | 11.43 |
| 44588.302083333336 | 11.41 |
| 44588.3125 | 11.4 |
| 44588.322916666664 | 11.38 |
| 44588.333333333336 | 11.37 |
| 44588.34375 | 11.37 |
| 44588.354166666664 | 11.35 |
| 44588.364583333336 | 11.35 |
| 44588.375 | 11.34 |
| 44588.385416666664 | 11.31 |
| 44588.395833333336 | 11.32 |
| 44588.40625 | 11.32 |
| 44588.416666666664 | 11.32 |
| 44588.427083333336 | 11.3 |
| 44588.4375 | 11.33 |
| 44588.447916666664 | 11.32 |
| 44588.458333333336 | 11.33 |
| 44588.46875 | 11.31 |
| 44588.479166666664 | 11.32 |
| 44588.489583333336 | 11.3 |
| 44588.5 | 11.29 |
| 44588.510416666664 | 11.34 |
| 44588.520833333336 | 11.34 |
| 44588.53125 | 11.42 |
| 44588.541666666664 | 11.44 |
| 44588.552083333336 | 11.43 |
| 44588.5625 | 11.46 |
| 44588.572916666664 | 11.48 |
| 44588.583333333336 | 11.51 |
| 44588.59375 | 11.53 |
| 44588.604166666664 | 11.55 |
| 44588.614583333336 | 11.59 |
| 44588.625 | 11.63 |
| 44588.635416666664 | 11.66 |
| 44588.645833333336 | 11.68 |
| 44588.65625 | 11.71 |
| 44588.666666666664 | 11.74 |
| 44588.677083333336 | 11.76 |
| 44588.6875 | 11.98 |
| 44588.697916666664 | 12.01 |
| 44588.708333333336 | 12.03 |
| 44588.71875 | 12.05 |
| 44588.729166666664 | 12.06 |
| 44588.739583333336 | 12.06 |
| 44588.75 | 12.05 |
| 44588.760416666664 | 12.07 |
| 44588.770833333336 | 12.1 |
| 44588.78125 | 12.11 |
| 44588.791666666664 | 12.11 |
| 44588.802083333336 | 12.13 |
| 44588.8125 | 12.13 |
| 44588.822916666664 | 12.13 |
| 44588.833333333336 | 12.14 |
| 44588.84375 | 12.14 |
| 44588.854166666664 | 12.16 |
| 44588.864583333336 | 12.18 |
| 44588.875 | 12.18 |
| 44588.885416666664 | 12.23 |
| 44588.895833333336 | 12.25 |
| 44588.90625 | 12.3 |
| 44588.916666666664 | 12.32 |
| 44588.927083333336 | 12.28 |
| 44588.9375 | 12.27 |
| 44588.947916666664 | 12.23 |
| 44588.958333333336 | 12.21 |
| 44588.96875 | 12.22 |
| 44588.979166666664 | 12.23 |
| 44588.989583333336 | 12.27 |
| 44589.0 | 12.3 |
| 44589.010416666664 | 12.31 |
| 44589.020833333336 | 12.35 |
| 44589.03125 | 12.38 |
| 44589.041666666664 | 12.4 |
| 44589.052083333336 | 12.42 |
| 44589.0625 | 12.43 |
| 44589.072916666664 | 12.42 |
| 44589.083333333336 | 12.41 |
| 44589.09375 | 12.44 |
| 44589.104166666664 | 12.47 |
| 44589.114583333336 | 12.47 |
| 44589.125 | 12.46 |
| 44589.135416666664 | 12.42 |
| 44589.145833333336 | 12.4 |
| 44589.15625 | 12.39 |
| 44589.166666666664 | 12.38 |
| 44589.177083333336 | 12.35 |
| 44589.1875 | 12.33 |
| 44589.197916666664 | 12.25 |
| 44589.208333333336 | 12.18 |
| 44589.21875 | 12.11 |
| 44589.229166666664 | 12.06 |
| 44589.239583333336 | 12.01 |
| 44589.25 | 11.98 |
| 44589.260416666664 | 11.94 |
| 44589.270833333336 | 11.92 |
| 44589.28125 | 11.89 |
| 44589.291666666664 | 11.87 |
| 44589.302083333336 | 11.83 |
| 44589.3125 | 11.78 |
| 44589.322916666664 | 11.75 |
| 44589.333333333336 | 11.73 |
| 44589.34375 | 11.71 |
| 44589.354166666664 | 11.71 |
| 44589.364583333336 | 11.7 |
| 44589.375 | 11.69 |
| 44589.385416666664 | 11.7 |
| 44589.395833333336 | 11.69 |
| 44589.40625 | 11.69 |
| 44589.416666666664 | 11.67 |
| 44589.427083333336 | 11.64 |
| 44589.4375 | 11.67 |
| 44589.447916666664 | 11.67 |
| 44589.458333333336 | 11.66 |
| 44589.46875 | 11.64 |
| 44589.479166666664 | 11.62 |
| 44589.489583333336 | 11.6 |
| 44589.5 | 11.59 |
| 44589.510416666664 | 11.58 |
| 44589.520833333336 | 11.56 |
| 44589.53125 | 11.53 |
| 44589.541666666664 | 11.48 |
| 44589.552083333336 | 11.49 |
| 44589.5625 | 11.57 |
| 44589.572916666664 | 11.65 |
| 44589.583333333336 | 11.72 |
| 44589.59375 | 11.75 |
| 44589.604166666664 | 11.79 |
| 44589.614583333336 | 11.8 |
| 44589.625 | 11.87 |
| 44589.635416666664 | 11.92 |
| 44589.645833333336 | 11.95 |
| 44589.65625 | 11.99 |
| 44589.666666666664 | 12.07 |
| 44589.677083333336 | 12.1 |
| 44589.6875 | 12.13 |
| 44589.697916666664 | 12.16 |
| 44589.708333333336 | 12.21 |
| 44589.71875 | 12.22 |
| 44589.729166666664 | 12.23 |
| 44589.739583333336 | 12.21 |
| 44589.75 | 12.21 |
| 44589.760416666664 | 12.2 |
| 44589.770833333336 | 12.16 |
| 44589.78125 | 12.13 |
| 44589.791666666664 | 12.14 |
| 44589.802083333336 | 12.17 |
| 44589.8125 | 12.2 |
| 44589.822916666664 | 12.22 |
| 44589.833333333336 | 12.23 |
| 44589.84375 | 12.21 |
| 44589.854166666664 | 12.21 |
| 44589.864583333336 | 12.21 |
| 44589.875 | 12.2 |
| 44589.885416666664 | 12.19 |
| 44589.895833333336 | 12.17 |
| 44589.90625 | 12.16 |
| 44589.916666666664 | 12.15 |
| 44589.927083333336 | 12.13 |
| 44589.9375 | 12.1 |
| 44589.947916666664 | 12.17 |
| 44589.958333333336 | 12.11 |
| 44589.96875 | 12.09 |
| 44589.979166666664 | 12.05 |
| 44589.989583333336 | 12.04 |
| 44590.0 | 12.01 |
| 44590.010416666664 | 11.98 |
| 44590.020833333336 | 11.94 |
| 44590.03125 | 11.87 |
| 44590.041666666664 | 11.85 |
| 44590.052083333336 | 11.8 |
| 44590.0625 | 11.72 |
| 44590.072916666664 | 11.67 |
| 44590.083333333336 | 11.67 |
| 44590.09375 | 11.72 |
| 44590.104166666664 | 11.73 |
| 44590.114583333336 | 11.7 |
| 44590.125 | 11.67 |
| 44590.135416666664 | 11.67 |
| 44590.145833333336 | 11.71 |
| 44590.15625 | 11.67 |
| 44590.166666666664 | 11.78 |
| 44590.177083333336 | 11.78 |
| 44590.1875 | 11.74 |
| 44590.197916666664 | 11.75 |
| 44590.208333333336 | 11.72 |
| 44590.21875 | 11.71 |
| 44590.229166666664 | 11.67 |
| 44590.239583333336 | 11.59 |
| 44590.25 | 11.53 |
| 44590.260416666664 | 11.5 |
| 44590.270833333336 | 11.48 |
| 44590.28125 | 11.44 |
| 44590.291666666664 | 11.4 |
| 44590.302083333336 | 11.38 |
| 44590.3125 | 11.36 |
| 44590.322916666664 | 11.34 |
| 44590.333333333336 | 11.33 |
| 44590.34375 | 11.32 |
| 44590.354166666664 | 11.31 |
| 44590.364583333336 | 11.3 |
| 44590.375 | 11.3 |
| 44590.385416666664 | 11.29 |
| 44590.395833333336 | 11.28 |
| 44590.40625 | 11.27 |
| 44590.416666666664 | 11.26 |
| 44590.427083333336 | 11.26 |
| 44590.4375 | 11.25 |
| 44590.447916666664 | 11.24 |
| 44590.458333333336 | 11.24 |
| 44590.46875 | 11.22 |
| 44590.479166666664 | 11.22 |
| 44590.489583333336 | 11.21 |
| 44590.5 | 11.22 |
| 44590.510416666664 | 11.22 |
| 44590.520833333336 | 11.21 |
| 44590.53125 | 11.22 |
| 44590.541666666664 | 11.23 |
| 44590.552083333336 | 11.23 |
| 44590.5625 | 11.23 |
| 44590.572916666664 | 11.23 |
| 44590.583333333336 | 11.27 |
| 44590.59375 | 11.29 |
| 44590.604166666664 | 11.31 |
| 44590.614583333336 | 11.34 |
| 44590.625 | 11.35 |
| 44590.635416666664 | 11.37 |
| 44590.645833333336 | 11.4 |
| 44590.65625 | 11.42 |
| 44590.666666666664 | 11.48 |
| 44590.677083333336 | 11.5 |
| 44590.6875 | 11.54 |
| 44590.697916666664 | 11.59 |
| 44590.708333333336 | 11.64 |
| 44590.71875 | 11.68 |
| 44590.729166666664 | 11.71 |
| 44590.739583333336 | 11.74 |
| 44590.75 | 11.76 |
| 44590.760416666664 | 11.78 |
| 44590.770833333336 | 11.78 |
| 44590.78125 | 11.77 |
| 44590.791666666664 | 11.75 |
| 44590.802083333336 | 11.71 |
| 44590.8125 | 11.64 |
| 44590.822916666664 | 11.64 |
| 44590.833333333336 | 11.65 |
| 44590.84375 | 11.66 |
| 44590.854166666664 | 11.66 |
| 44590.864583333336 | 11.65 |
| 44590.875 | 11.64 |
| 44590.885416666664 | 11.62 |
| 44590.895833333336 | 11.61 |
| 44590.90625 | 11.57 |
| 44590.916666666664 | 11.53 |
| 44590.927083333336 | 11.5 |
| 44590.9375 | 11.47 |
| 44590.947916666664 | 11.44 |
| 44590.958333333336 | 11.43 |
| 44590.96875 | 11.42 |
| 44590.979166666664 | 11.41 |
| 44590.989583333336 | 11.43 |
| 44591.0 | 11.47 |
| 44591.010416666664 | 11.42 |
| 44591.020833333336 | 11.43 |
| 44591.03125 | 11.44 |
| 44591.041666666664 | 11.44 |
| 44591.052083333336 | 11.44 |
| 44591.0625 | 11.45 |
| 44591.072916666664 | 11.47 |
| 44591.083333333336 | 11.49 |
| 44591.09375 | 11.49 |
| 44591.104166666664 | 11.52 |
| 44591.114583333336 | 11.51 |
| 44591.125 | 11.5 |
| 44591.135416666664 | 11.5 |
| 44591.145833333336 | 11.49 |
| 44591.15625 | 11.51 |
| 44591.166666666664 | 11.57 |
| 44591.177083333336 | 11.59 |
| 44591.1875 | 11.64 |
| 44591.197916666664 | 11.71 |
| 44591.208333333336 | 11.73 |
| 44591.21875 | 11.76 |
| 44591.229166666664 | 11.78 |
| 44591.239583333336 | 11.75 |
| 44591.25 | 11.73 |
| 44591.260416666664 | 11.69 |
| 44591.270833333336 | 11.66 |
| 44591.28125 | 11.64 |
| 44591.291666666664 | 11.6 |
| 44591.302083333336 | 11.58 |
| 44591.3125 | 11.58 |
| 44591.322916666664 | 11.57 |
| 44591.333333333336 | 11.59 |
| 44591.34375 | 11.59 |
| 44591.354166666664 | 11.6 |
| 44591.364583333336 | 11.59 |
| 44591.375 | 11.56 |
| 44591.385416666664 | 11.5 |
| 44591.395833333336 | 11.43 |
| 44591.40625 | 11.4 |
| 44591.416666666664 | 11.39 |
| 44591.427083333336 | 11.38 |
| 44591.4375 | 11.38 |
| 44591.447916666664 | 11.39 |
| 44591.458333333336 | 11.39 |
| 44591.46875 | 11.38 |
| 44591.479166666664 | 11.36 |
| 44591.489583333336 | 11.35 |
| 44591.5 | 11.33 |
| 44591.510416666664 | 11.32 |
| 44591.520833333336 | 11.34 |
| 44591.53125 | 11.35 |
| 44591.541666666664 | 11.35 |
| 44591.552083333336 | 11.38 |
| 44591.5625 | 11.4 |
| 44591.572916666664 | 11.44 |
| 44591.583333333336 | 11.46 |
| 44591.59375 | 11.52 |
| 44591.604166666664 | 11.56 |
| 44591.614583333336 | 11.56 |
| 44591.625 | 11.64 |
| 44591.635416666664 | 11.68 |
| 44591.645833333336 | 11.68 |
| 44591.65625 | 11.7 |
| 44591.666666666664 | 11.74 |
| 44591.677083333336 | 11.75 |
| 44591.6875 | 11.78 |
| 44591.697916666664 | 11.8 |
| 44591.708333333336 | 11.82 |
| 44591.71875 | 11.83 |
| 44591.729166666664 | 11.87 |
| 44591.739583333336 | 11.89 |
| 44591.75 | 11.92 |
| 44591.760416666664 | 11.95 |
| 44591.770833333336 | 11.96 |
| 44591.78125 | 11.96 |
| 44591.791666666664 | 11.98 |
| 44591.802083333336 | 11.97 |
| 44591.8125 | 11.98 |
| 44591.822916666664 | 11.97 |
| 44591.833333333336 | 11.96 |
| 44591.84375 | 11.96 |
| 44591.854166666664 | 11.94 |
| 44591.864583333336 | 11.93 |
| 44591.875 | 11.94 |
| 44591.885416666664 | 11.93 |
| 44591.895833333336 | 11.94 |
| 44591.90625 | 11.94 |
| 44591.916666666664 | 11.95 |
| 44591.927083333336 | 11.95 |
| 44591.9375 | 11.94 |
| 44591.947916666664 | 11.93 |
| 44591.958333333336 | 11.91 |
| 44591.96875 | 11.88 |
| 44591.979166666664 | 11.85 |
| 44591.989583333336 | 11.83 |
| 44592.0 | 11.82 |
| 44592.010416666664 | 11.87 |
| 44592.020833333336 | 11.85 |
| 44592.03125 | 11.85 |
| 44592.041666666664 | 11.86 |
| 44592.052083333336 | 11.82 |
| 44592.0625 | 11.82 |
| 44592.072916666664 | 11.8 |
| 44592.083333333336 | 11.79 |
| 44592.09375 | 11.76 |
| 44592.104166666664 | 11.74 |
| 44592.114583333336 | 11.73 |
| 44592.125 | 11.71 |
| 44592.135416666664 | 11.69 |
| 44592.145833333336 | 11.68 |
| 44592.15625 | 11.72 |
| 44592.166666666664 | 11.72 |
| 44592.177083333336 | 11.72 |
| 44592.1875 | 11.72 |
| 44592.197916666664 | 11.79 |
| 44592.208333333336 | 11.79 |
| 44592.21875 | 11.77 |
| 44592.229166666664 | 11.78 |
| 44592.239583333336 | 11.71 |
| 44592.25 | 11.68 |
| 44592.260416666664 | 11.76 |
| 44592.270833333336 | 11.74 |
| 44592.28125 | 11.69 |
| 44592.291666666664 | 11.76 |
| 44592.302083333336 | 11.78 |
| 44592.3125 | 11.79 |
| 44592.322916666664 | 11.78 |
| 44592.333333333336 | 11.74 |
| 44592.34375 | 11.73 |
| 44592.354166666664 | 11.7 |
| 44592.364583333336 | 11.65 |
| 44592.375 | 11.64 |
| 44592.385416666664 | 11.62 |
| 44592.395833333336 | 11.6 |
| 44592.40625 | 11.58 |
| 44592.416666666664 | 11.57 |
| 44592.427083333336 | 11.58 |
| 44592.4375 | 11.59 |
| 44592.447916666664 | 11.59 |
| 44592.458333333336 | 11.6 |
| 44592.46875 | 11.6 |
| 44592.479166666664 | 11.61 |
| 44592.489583333336 | 11.64 |
| 44592.5 | 11.65 |
| 44592.510416666664 | 11.65 |
| 44592.520833333336 | 11.66 |
| 44592.53125 | 11.66 |
| 44592.541666666664 | 11.68 |
| 44592.552083333336 | 11.59 |
| 44592.5625 | 11.62 |
| 44592.572916666664 | 11.7 |
| 44592.583333333336 | 11.71 |
| 44592.59375 | 11.72 |
| 44592.604166666664 | 11.73 |
| 44592.614583333336 | 11.75 |
| 44592.625 | 11.76 |
| 44592.635416666664 | 11.75 |
| 44592.645833333336 | 11.75 |
| 44592.65625 | 11.78 |
| 44592.666666666664 | 11.8 |
| 44592.677083333336 | 11.82 |
| 44592.6875 | 11.86 |
| 44592.697916666664 | 11.86 |
| 44592.708333333336 | 11.88 |
| 44592.71875 | 11.89 |
| 44592.729166666664 | 11.91 |
| 44592.739583333336 | 11.94 |
| 44592.75 | 11.96 |
| 44592.760416666664 | 11.98 |
| 44592.770833333336 | 12.02 |
| 44592.78125 | 12.04 |
| 44592.791666666664 | 12.06 |
| 44592.802083333336 | 12.08 |
| 44592.8125 | 12.11 |
| 44592.822916666664 | 12.02 |
| 44592.833333333336 | 12.05 |
| 44592.84375 | 12.02 |
| 44592.854166666664 | 12.04 |
| 44592.864583333336 | 12.05 |
| 44592.875 | 12.06 |
| 44592.885416666664 | 12.01 |
| 44592.895833333336 | 11.94 |
| 44592.90625 | 11.89 |
| 44592.916666666664 | 11.82 |
| 44592.927083333336 | 11.76 |
| 44592.9375 | 11.72 |
| 44592.947916666664 | 11.67 |
| 44592.958333333336 | 11.61 |
| 44592.96875 | 11.54 |
| 44592.979166666664 | 11.55 |
| 44592.989583333336 | 11.6 |
| 44593.0 | 11.64 |
| 44593.010416666664 | 11.68 |
| 44593.020833333336 | 11.68 |
| 44593.03125 | 11.68 |
| 44593.041666666664 | 11.69 |
| 44593.052083333336 | 11.65 |
| 44593.0625 | 11.68 |
| 44593.072916666664 | 11.68 |
| 44593.083333333336 | 11.66 |
| 44593.09375 | 11.62 |
| 44593.104166666664 | 11.6 |
| 44593.114583333336 | 11.55 |
| 44593.125 | 11.54 |
| 44593.135416666664 | 11.45 |
| 44593.145833333336 | 11.43 |
| 44593.15625 | 11.32 |